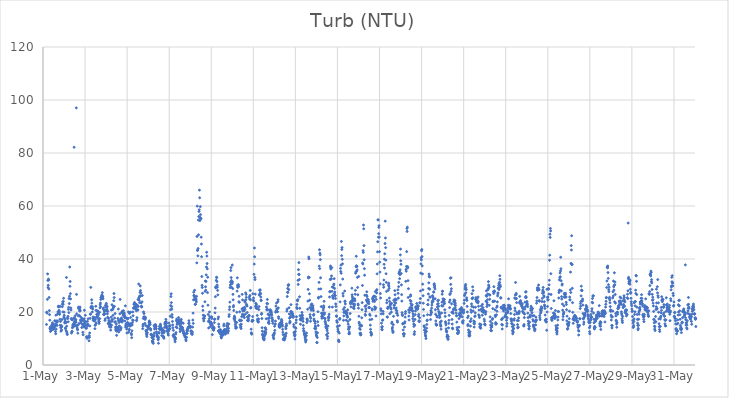
| Category | Turb (NTU) |
|---|---|
| 44682.166666666664 | 15.31 |
| 44682.177083333336 | 19.94 |
| 44682.1875 | 19.66 |
| 44682.197916666664 | 19.62 |
| 44682.208333333336 | 24.77 |
| 44682.21875 | 34.37 |
| 44682.229166666664 | 31.93 |
| 44682.239583333336 | 29.25 |
| 44682.25 | 30.1 |
| 44682.260416666664 | 32.41 |
| 44682.270833333336 | 32.02 |
| 44682.28125 | 28.68 |
| 44682.291666666664 | 25.48 |
| 44682.302083333336 | 20.53 |
| 44682.3125 | 19 |
| 44682.322916666664 | 16.9 |
| 44682.333333333336 | 13.7 |
| 44682.34375 | 14.1 |
| 44682.354166666664 | 12.65 |
| 44682.364583333336 | 14.53 |
| 44682.375 | 13.45 |
| 44682.385416666664 | 13.19 |
| 44682.395833333336 | 13.13 |
| 44682.40625 | 14.02 |
| 44682.416666666664 | 13.38 |
| 44682.427083333336 | 14.59 |
| 44682.4375 | 15.2 |
| 44682.447916666664 | 15.91 |
| 44682.458333333336 | 15.42 |
| 44682.46875 | 14.2 |
| 44682.479166666664 | 15.15 |
| 44682.489583333336 | 14.66 |
| 44682.5 | 13.91 |
| 44682.510416666664 | 13.48 |
| 44682.520833333336 | 14.08 |
| 44682.53125 | 14.3 |
| 44682.541666666664 | 14.42 |
| 44682.552083333336 | 14.63 |
| 44682.5625 | 16.67 |
| 44682.572916666664 | 16.63 |
| 44682.583333333336 | 15.41 |
| 44682.59375 | 12.63 |
| 44682.604166666664 | 11.8 |
| 44682.614583333336 | 18.81 |
| 44682.625 | 13.55 |
| 44682.635416666664 | 15.16 |
| 44682.645833333336 | 16.61 |
| 44682.65625 | 16.1 |
| 44682.666666666664 | 14.93 |
| 44682.677083333336 | 16.27 |
| 44682.6875 | 16.62 |
| 44682.697916666664 | 19.16 |
| 44682.708333333336 | 20.02 |
| 44682.71875 | 19.45 |
| 44682.729166666664 | 22.06 |
| 44682.739583333336 | 22.18 |
| 44682.75 | 21.88 |
| 44682.760416666664 | 20.62 |
| 44682.770833333336 | 20.28 |
| 44682.78125 | 19.63 |
| 44682.791666666664 | 19.1 |
| 44682.802083333336 | 17.27 |
| 44682.8125 | 15 |
| 44682.822916666664 | 22.17 |
| 44682.833333333336 | 16.41 |
| 44682.84375 | 14.07 |
| 44682.854166666664 | 12.75 |
| 44682.864583333336 | 14.84 |
| 44682.875 | 14.23 |
| 44682.885416666664 | 13.24 |
| 44682.895833333336 | 14.72 |
| 44682.90625 | 17.15 |
| 44682.916666666664 | 22 |
| 44682.927083333336 | 23 |
| 44682.9375 | 23.77 |
| 44682.947916666664 | 20.05 |
| 44682.958333333336 | 22.9 |
| 44682.96875 | 23.99 |
| 44682.979166666664 | 25.17 |
| 44682.989583333336 | 18.12 |
| 44683.0 | 19.95 |
| 44683.010416666664 | 18.77 |
| 44683.020833333336 | 17.67 |
| 44683.03125 | 15.88 |
| 44683.041666666664 | 16.25 |
| 44683.052083333336 | 17.07 |
| 44683.0625 | 13.96 |
| 44683.072916666664 | 13.7 |
| 44683.083333333336 | 16.28 |
| 44683.09375 | 15.92 |
| 44683.104166666664 | 12.88 |
| 44683.114583333336 | 33.03 |
| 44683.125 | 14.63 |
| 44683.135416666664 | 12.36 |
| 44683.145833333336 | 11.71 |
| 44683.15625 | 11.5 |
| 44683.166666666664 | 17.73 |
| 44683.177083333336 | 17.53 |
| 44683.1875 | 18.36 |
| 44683.197916666664 | 16.3 |
| 44683.208333333336 | 20.99 |
| 44683.21875 | 21.74 |
| 44683.229166666664 | 19.76 |
| 44683.239583333336 | 25.09 |
| 44683.25 | 23.19 |
| 44683.260416666664 | 25.97 |
| 44683.270833333336 | 36.99 |
| 44683.28125 | 29.7 |
| 44683.291666666664 | 31.52 |
| 44683.302083333336 | 26.95 |
| 44683.3125 | 24.93 |
| 44683.322916666664 | 21.53 |
| 44683.333333333336 | 20.76 |
| 44683.34375 | 17.53 |
| 44683.354166666664 | 12.06 |
| 44683.364583333336 | 17.12 |
| 44683.375 | 12.7 |
| 44683.385416666664 | 12.57 |
| 44683.395833333336 | 14.06 |
| 44683.40625 | 17.05 |
| 44683.416666666664 | 14.8 |
| 44683.427083333336 | 15.36 |
| 44683.4375 | 14.43 |
| 44683.447916666664 | 14.48 |
| 44683.458333333336 | 17.72 |
| 44683.46875 | 15.02 |
| 44683.479166666664 | 82.18 |
| 44683.489583333336 | 16.14 |
| 44683.5 | 16.13 |
| 44683.510416666664 | 15.41 |
| 44683.520833333336 | 17.61 |
| 44683.53125 | 18.59 |
| 44683.541666666664 | 16.83 |
| 44683.552083333336 | 14.84 |
| 44683.5625 | 17.07 |
| 44683.572916666664 | 16.15 |
| 44683.583333333336 | 97.03 |
| 44683.59375 | 26.65 |
| 44683.604166666664 | 19.31 |
| 44683.614583333336 | 14.84 |
| 44683.625 | 13.98 |
| 44683.635416666664 | 13.48 |
| 44683.645833333336 | 13.3 |
| 44683.65625 | 12.02 |
| 44683.666666666664 | 15.1 |
| 44683.677083333336 | 18.55 |
| 44683.6875 | 21.84 |
| 44683.697916666664 | 21.31 |
| 44683.708333333336 | 21.2 |
| 44683.71875 | 15.66 |
| 44683.729166666664 | 18.7 |
| 44683.739583333336 | 20.39 |
| 44683.75 | 21.14 |
| 44683.760416666664 | 21.87 |
| 44683.770833333336 | 20.47 |
| 44683.78125 | 16.99 |
| 44683.791666666664 | 18.11 |
| 44683.802083333336 | 16.64 |
| 44683.8125 | 16.37 |
| 44683.822916666664 | 15.72 |
| 44683.833333333336 | 16.74 |
| 44683.84375 | 14.14 |
| 44683.854166666664 | 16.99 |
| 44683.864583333336 | 17.38 |
| 44683.875 | 17.48 |
| 44683.885416666664 | 15.17 |
| 44683.895833333336 | 12.34 |
| 44683.90625 | 11.42 |
| 44683.916666666664 | 15.48 |
| 44683.927083333336 | 16.86 |
| 44683.9375 | 14.38 |
| 44683.947916666664 | 14.78 |
| 44683.958333333336 | 17.45 |
| 44683.96875 | 20.65 |
| 44683.979166666664 | 15.52 |
| 44683.989583333336 | 16.1 |
| 44684.0 | 16.4 |
| 44684.010416666664 | 18.76 |
| 44684.020833333336 | 16.26 |
| 44684.03125 | 14.89 |
| 44684.041666666664 | 13.93 |
| 44684.052083333336 | 14 |
| 44684.0625 | 13.84 |
| 44684.072916666664 | 10.57 |
| 44684.083333333336 | 10.64 |
| 44684.09375 | 10.06 |
| 44684.104166666664 | 15.27 |
| 44684.114583333336 | 16.48 |
| 44684.125 | 14.77 |
| 44684.135416666664 | 15.44 |
| 44684.145833333336 | 17.44 |
| 44684.15625 | 10.5 |
| 44684.166666666664 | 10.84 |
| 44684.177083333336 | 10.61 |
| 44684.1875 | 9.14 |
| 44684.197916666664 | 11.09 |
| 44684.208333333336 | 10.47 |
| 44684.21875 | 12.08 |
| 44684.229166666664 | 14.74 |
| 44684.239583333336 | 17.59 |
| 44684.25 | 19.2 |
| 44684.260416666664 | 19.17 |
| 44684.270833333336 | 29.29 |
| 44684.28125 | 21.57 |
| 44684.291666666664 | 22.08 |
| 44684.302083333336 | 21.73 |
| 44684.3125 | 24.61 |
| 44684.322916666664 | 23.34 |
| 44684.333333333336 | 21.66 |
| 44684.34375 | 20.03 |
| 44684.354166666664 | 22.02 |
| 44684.364583333336 | 21.1 |
| 44684.375 | 18.12 |
| 44684.385416666664 | 16.89 |
| 44684.395833333336 | 17.46 |
| 44684.40625 | 17.58 |
| 44684.416666666664 | 17.29 |
| 44684.427083333336 | 16.83 |
| 44684.4375 | 16.57 |
| 44684.447916666664 | 17.88 |
| 44684.458333333336 | 16.81 |
| 44684.46875 | 13.69 |
| 44684.479166666664 | 14.94 |
| 44684.489583333336 | 17.17 |
| 44684.5 | 15.27 |
| 44684.510416666664 | 22.15 |
| 44684.520833333336 | 20.64 |
| 44684.53125 | 15.85 |
| 44684.541666666664 | 18 |
| 44684.552083333336 | 19.11 |
| 44684.5625 | 20.39 |
| 44684.572916666664 | 18.38 |
| 44684.583333333336 | 19.22 |
| 44684.59375 | 20.29 |
| 44684.604166666664 | 20.37 |
| 44684.614583333336 | 17.89 |
| 44684.625 | 19.53 |
| 44684.635416666664 | 18.9 |
| 44684.645833333336 | 17.01 |
| 44684.65625 | 16.39 |
| 44684.666666666664 | 15.66 |
| 44684.677083333336 | 16.41 |
| 44684.6875 | 19.89 |
| 44684.697916666664 | 17.49 |
| 44684.708333333336 | 21.54 |
| 44684.71875 | 22.72 |
| 44684.729166666664 | 23.38 |
| 44684.739583333336 | 21.97 |
| 44684.75 | 24.73 |
| 44684.760416666664 | 25.44 |
| 44684.770833333336 | 25.56 |
| 44684.78125 | 25.12 |
| 44684.791666666664 | 26.1 |
| 44684.802083333336 | 26.42 |
| 44684.8125 | 26.1 |
| 44684.822916666664 | 27.32 |
| 44684.833333333336 | 25.83 |
| 44684.84375 | 25.7 |
| 44684.854166666664 | 24.97 |
| 44684.864583333336 | 21.1 |
| 44684.875 | 21.51 |
| 44684.885416666664 | 19.05 |
| 44684.895833333336 | 18.98 |
| 44684.90625 | 19.47 |
| 44684.916666666664 | 20.55 |
| 44684.927083333336 | 20.23 |
| 44684.9375 | 19.31 |
| 44684.947916666664 | 16.84 |
| 44684.958333333336 | 17.41 |
| 44684.96875 | 22.38 |
| 44684.979166666664 | 20.55 |
| 44684.989583333336 | 21.83 |
| 44685.0 | 22.78 |
| 44685.010416666664 | 23.25 |
| 44685.020833333336 | 22.3 |
| 44685.03125 | 20.35 |
| 44685.041666666664 | 21.03 |
| 44685.052083333336 | 21.97 |
| 44685.0625 | 19.31 |
| 44685.072916666664 | 17.98 |
| 44685.083333333336 | 20.24 |
| 44685.09375 | 17.72 |
| 44685.104166666664 | 15.76 |
| 44685.114583333336 | 17.66 |
| 44685.125 | 15.35 |
| 44685.135416666664 | 16.6 |
| 44685.145833333336 | 16.72 |
| 44685.15625 | 15.39 |
| 44685.166666666664 | 14.34 |
| 44685.177083333336 | 14.68 |
| 44685.1875 | 15.5 |
| 44685.197916666664 | 16.09 |
| 44685.208333333336 | 14.97 |
| 44685.21875 | 13.16 |
| 44685.229166666664 | 14.26 |
| 44685.239583333336 | 18.02 |
| 44685.25 | 20.75 |
| 44685.260416666664 | 15 |
| 44685.270833333336 | 16.97 |
| 44685.28125 | 22.72 |
| 44685.291666666664 | 16.54 |
| 44685.302083333336 | 17.14 |
| 44685.3125 | 20.91 |
| 44685.322916666664 | 18.72 |
| 44685.333333333336 | 21.41 |
| 44685.34375 | 22 |
| 44685.354166666664 | 22.02 |
| 44685.364583333336 | 24.26 |
| 44685.375 | 26.96 |
| 44685.385416666664 | 25.47 |
| 44685.395833333336 | 22.12 |
| 44685.40625 | 17.71 |
| 44685.416666666664 | 16.15 |
| 44685.427083333336 | 19.41 |
| 44685.4375 | 16.32 |
| 44685.447916666664 | 14.12 |
| 44685.458333333336 | 13.45 |
| 44685.46875 | 13 |
| 44685.479166666664 | 14.48 |
| 44685.489583333336 | 15.48 |
| 44685.5 | 11.18 |
| 44685.510416666664 | 12.71 |
| 44685.520833333336 | 14.2 |
| 44685.53125 | 13.4 |
| 44685.541666666664 | 14.12 |
| 44685.552083333336 | 13.75 |
| 44685.5625 | 17.57 |
| 44685.572916666664 | 16.79 |
| 44685.583333333336 | 21.11 |
| 44685.59375 | 14.4 |
| 44685.604166666664 | 12.48 |
| 44685.614583333336 | 16.06 |
| 44685.625 | 13.28 |
| 44685.635416666664 | 14.74 |
| 44685.645833333336 | 16.39 |
| 44685.65625 | 19.31 |
| 44685.666666666664 | 24.74 |
| 44685.677083333336 | 17.19 |
| 44685.6875 | 13.24 |
| 44685.697916666664 | 13.77 |
| 44685.708333333336 | 14.13 |
| 44685.71875 | 16.65 |
| 44685.729166666664 | 17.74 |
| 44685.739583333336 | 19.89 |
| 44685.75 | 17.13 |
| 44685.760416666664 | 16.17 |
| 44685.770833333336 | 20.26 |
| 44685.78125 | 19.67 |
| 44685.791666666664 | 16.78 |
| 44685.802083333336 | 19.33 |
| 44685.8125 | 18.69 |
| 44685.822916666664 | 20.5 |
| 44685.833333333336 | 19.76 |
| 44685.84375 | 19.1 |
| 44685.854166666664 | 19.08 |
| 44685.864583333336 | 19.54 |
| 44685.875 | 17.96 |
| 44685.885416666664 | 18.49 |
| 44685.895833333336 | 16.63 |
| 44685.90625 | 17.92 |
| 44685.916666666664 | 22.32 |
| 44685.927083333336 | 14.31 |
| 44685.9375 | 14.9 |
| 44685.947916666664 | 15.36 |
| 44685.958333333336 | 15.58 |
| 44685.96875 | 17.72 |
| 44685.979166666664 | 13.57 |
| 44685.989583333336 | 12.1 |
| 44686.0 | 15.9 |
| 44686.010416666664 | 14.5 |
| 44686.020833333336 | 17.37 |
| 44686.03125 | 16 |
| 44686.041666666664 | 17.64 |
| 44686.052083333336 | 15.08 |
| 44686.0625 | 20.03 |
| 44686.072916666664 | 12.38 |
| 44686.083333333336 | 15.42 |
| 44686.09375 | 13.26 |
| 44686.104166666664 | 13.43 |
| 44686.114583333336 | 19.46 |
| 44686.125 | 15.49 |
| 44686.135416666664 | 14.63 |
| 44686.145833333336 | 19.82 |
| 44686.15625 | 19.93 |
| 44686.166666666664 | 17.92 |
| 44686.177083333336 | 15.58 |
| 44686.1875 | 15.01 |
| 44686.197916666664 | 11.94 |
| 44686.208333333336 | 11.4 |
| 44686.21875 | 10.31 |
| 44686.229166666664 | 12.91 |
| 44686.239583333336 | 15.11 |
| 44686.25 | 16 |
| 44686.260416666664 | 16.96 |
| 44686.270833333336 | 20.04 |
| 44686.28125 | 18.6 |
| 44686.291666666664 | 16.86 |
| 44686.302083333336 | 21.46 |
| 44686.3125 | 21.58 |
| 44686.322916666664 | 22.89 |
| 44686.333333333336 | 21.47 |
| 44686.34375 | 23.13 |
| 44686.354166666664 | 23.56 |
| 44686.364583333336 | 22.06 |
| 44686.375 | 23.04 |
| 44686.385416666664 | 21.27 |
| 44686.395833333336 | 21.29 |
| 44686.40625 | 22.99 |
| 44686.416666666664 | 21.75 |
| 44686.427083333336 | 22.68 |
| 44686.4375 | 20.47 |
| 44686.447916666664 | 16.73 |
| 44686.458333333336 | 17.01 |
| 44686.46875 | 17.87 |
| 44686.479166666664 | 22.6 |
| 44686.489583333336 | 22.23 |
| 44686.5 | 20.86 |
| 44686.510416666664 | 20.72 |
| 44686.520833333336 | 24.73 |
| 44686.53125 | 22.11 |
| 44686.541666666664 | 24.7 |
| 44686.552083333336 | 30.55 |
| 44686.5625 | 25.44 |
| 44686.572916666664 | 24.45 |
| 44686.583333333336 | 25.66 |
| 44686.59375 | 23.55 |
| 44686.604166666664 | 26.09 |
| 44686.614583333336 | 27.41 |
| 44686.625 | 29.84 |
| 44686.635416666664 | 28.1 |
| 44686.645833333336 | 26.1 |
| 44686.65625 | 27.22 |
| 44686.666666666664 | 23.42 |
| 44686.677083333336 | 22.19 |
| 44686.6875 | 21.99 |
| 44686.697916666664 | 21.88 |
| 44686.708333333336 | 23.83 |
| 44686.71875 | 26.22 |
| 44686.739583333336 | 13.72 |
| 44686.75 | 14.66 |
| 44686.760416666664 | 15.37 |
| 44686.770833333336 | 17.58 |
| 44686.78125 | 20.03 |
| 44686.791666666664 | 18.12 |
| 44686.802083333336 | 19.41 |
| 44686.8125 | 17.49 |
| 44686.822916666664 | 18.14 |
| 44686.833333333336 | 17.83 |
| 44686.84375 | 15.72 |
| 44686.854166666664 | 17.2 |
| 44686.864583333336 | 18.02 |
| 44686.875 | 17.76 |
| 44686.885416666664 | 14.9 |
| 44686.895833333336 | 13.03 |
| 44686.90625 | 12.75 |
| 44686.916666666664 | 11.98 |
| 44686.927083333336 | 11.33 |
| 44686.9375 | 10.77 |
| 44686.947916666664 | 11.74 |
| 44686.958333333336 | 12.23 |
| 44686.96875 | 13.41 |
| 44686.979166666664 | 14.29 |
| 44686.989583333336 | 14.58 |
| 44687.0 | 14.5 |
| 44687.010416666664 | 14.11 |
| 44687.020833333336 | 14.75 |
| 44687.03125 | 14.96 |
| 44687.041666666664 | 16.06 |
| 44687.052083333336 | 16.61 |
| 44687.0625 | 16.28 |
| 44687.072916666664 | 15.7 |
| 44687.083333333336 | 16.01 |
| 44687.09375 | 15.32 |
| 44687.104166666664 | 13.69 |
| 44687.114583333336 | 13.61 |
| 44687.125 | 13.17 |
| 44687.135416666664 | 11.52 |
| 44687.145833333336 | 11.47 |
| 44687.15625 | 11.58 |
| 44687.166666666664 | 11.19 |
| 44687.177083333336 | 10.46 |
| 44687.1875 | 10.32 |
| 44687.197916666664 | 9.12 |
| 44687.208333333336 | 8.9 |
| 44687.21875 | 8.54 |
| 44687.229166666664 | 8.69 |
| 44687.239583333336 | 8.17 |
| 44687.25 | 9.72 |
| 44687.260416666664 | 10.7 |
| 44687.270833333336 | 11.19 |
| 44687.28125 | 14.87 |
| 44687.291666666664 | 12.06 |
| 44687.302083333336 | 13.6 |
| 44687.3125 | 14.32 |
| 44687.322916666664 | 15.16 |
| 44687.333333333336 | 14.48 |
| 44687.34375 | 15 |
| 44687.354166666664 | 15.19 |
| 44687.364583333336 | 14.68 |
| 44687.375 | 14.58 |
| 44687.385416666664 | 13.75 |
| 44687.395833333336 | 12.54 |
| 44687.40625 | 11.8 |
| 44687.416666666664 | 11.26 |
| 44687.427083333336 | 10.83 |
| 44687.4375 | 10.99 |
| 44687.447916666664 | 10.59 |
| 44687.458333333336 | 10.6 |
| 44687.46875 | 9.79 |
| 44687.479166666664 | 9.52 |
| 44687.489583333336 | 8.19 |
| 44687.5 | 10.35 |
| 44687.510416666664 | 12.26 |
| 44687.520833333336 | 12.01 |
| 44687.53125 | 13.56 |
| 44687.541666666664 | 14.61 |
| 44687.552083333336 | 13.52 |
| 44687.5625 | 14.05 |
| 44687.572916666664 | 13.8 |
| 44687.583333333336 | 15.39 |
| 44687.59375 | 14.71 |
| 44687.604166666664 | 13.25 |
| 44687.614583333336 | 14.02 |
| 44687.625 | 13.76 |
| 44687.635416666664 | 13.72 |
| 44687.645833333336 | 11.11 |
| 44687.65625 | 13.07 |
| 44687.666666666664 | 12.16 |
| 44687.677083333336 | 12.88 |
| 44687.6875 | 13.47 |
| 44687.697916666664 | 12.6 |
| 44687.708333333336 | 12.04 |
| 44687.71875 | 10.86 |
| 44687.729166666664 | 10.53 |
| 44687.739583333336 | 10.6 |
| 44687.75 | 10.07 |
| 44687.760416666664 | 12.33 |
| 44687.770833333336 | 12.83 |
| 44687.78125 | 14.22 |
| 44687.791666666664 | 15.41 |
| 44687.802083333336 | 15.83 |
| 44687.8125 | 16.1 |
| 44687.822916666664 | 14.47 |
| 44687.833333333336 | 16.09 |
| 44687.84375 | 17.23 |
| 44687.854166666664 | 16.37 |
| 44687.864583333336 | 14.83 |
| 44687.875 | 15.72 |
| 44687.885416666664 | 13.91 |
| 44687.895833333336 | 14.18 |
| 44687.90625 | 13.03 |
| 44687.916666666664 | 12.7 |
| 44687.927083333336 | 12.61 |
| 44687.9375 | 12.69 |
| 44687.947916666664 | 11.8 |
| 44687.958333333336 | 11.28 |
| 44687.96875 | 12.8 |
| 44687.979166666664 | 13.15 |
| 44687.989583333336 | 15.82 |
| 44688.0 | 14.64 |
| 44688.010416666664 | 13.6 |
| 44688.020833333336 | 14.59 |
| 44688.03125 | 13.68 |
| 44688.041666666664 | 14.86 |
| 44688.052083333336 | 18.37 |
| 44688.0625 | 20.87 |
| 44688.072916666664 | 22.41 |
| 44688.083333333336 | 25.85 |
| 44688.09375 | 26.87 |
| 44688.104166666664 | 23.54 |
| 44688.114583333336 | 22.03 |
| 44688.125 | 21.05 |
| 44688.135416666664 | 19.01 |
| 44688.145833333336 | 17.99 |
| 44688.15625 | 16.45 |
| 44688.166666666664 | 15.13 |
| 44688.177083333336 | 14.07 |
| 44688.1875 | 11.22 |
| 44688.197916666664 | 13.08 |
| 44688.208333333336 | 10.89 |
| 44688.21875 | 11.53 |
| 44688.229166666664 | 10.56 |
| 44688.239583333336 | 10.44 |
| 44688.25 | 10.51 |
| 44688.260416666664 | 10.54 |
| 44688.270833333336 | 9.44 |
| 44688.28125 | 8.75 |
| 44688.291666666664 | 9.7 |
| 44688.302083333336 | 10.2 |
| 44688.3125 | 11.67 |
| 44688.322916666664 | 12.23 |
| 44688.333333333336 | 14.4 |
| 44688.34375 | 16.68 |
| 44688.354166666664 | 17.33 |
| 44688.364583333336 | 14.06 |
| 44688.375 | 15.45 |
| 44688.385416666664 | 15.41 |
| 44688.395833333336 | 16.23 |
| 44688.40625 | 16.13 |
| 44688.416666666664 | 16.78 |
| 44688.427083333336 | 16.26 |
| 44688.4375 | 16.26 |
| 44688.447916666664 | 17.91 |
| 44688.458333333336 | 16.59 |
| 44688.46875 | 16.76 |
| 44688.479166666664 | 17.04 |
| 44688.489583333336 | 15.78 |
| 44688.5 | 15.23 |
| 44688.510416666664 | 13.7 |
| 44688.520833333336 | 12.6 |
| 44688.53125 | 13.34 |
| 44688.541666666664 | 14.76 |
| 44688.552083333336 | 14.45 |
| 44688.5625 | 16.58 |
| 44688.572916666664 | 17.21 |
| 44688.583333333336 | 15.75 |
| 44688.59375 | 16.02 |
| 44688.604166666664 | 14.29 |
| 44688.614583333336 | 13.33 |
| 44688.625 | 14.12 |
| 44688.635416666664 | 14.03 |
| 44688.645833333336 | 13.42 |
| 44688.65625 | 12.77 |
| 44688.666666666664 | 15.74 |
| 44688.677083333336 | 12.05 |
| 44688.6875 | 12.65 |
| 44688.697916666664 | 11.72 |
| 44688.708333333336 | 11.77 |
| 44688.71875 | 11.23 |
| 44688.729166666664 | 12.06 |
| 44688.739583333336 | 11.53 |
| 44688.75 | 10.61 |
| 44688.760416666664 | 10.61 |
| 44688.770833333336 | 10.49 |
| 44688.78125 | 10.61 |
| 44688.791666666664 | 9.66 |
| 44688.802083333336 | 9.14 |
| 44688.8125 | 10.34 |
| 44688.822916666664 | 10.48 |
| 44688.833333333336 | 11.91 |
| 44688.84375 | 13.1 |
| 44688.854166666664 | 11.95 |
| 44688.864583333336 | 12.75 |
| 44688.875 | 13.34 |
| 44688.885416666664 | 13.89 |
| 44688.895833333336 | 13.81 |
| 44688.90625 | 14.24 |
| 44688.916666666664 | 14.21 |
| 44688.927083333336 | 15.64 |
| 44688.9375 | 16.72 |
| 44688.947916666664 | 15.87 |
| 44688.958333333336 | 14.38 |
| 44688.96875 | 14.63 |
| 44688.979166666664 | 14.7 |
| 44688.989583333336 | 14.66 |
| 44689.0 | 14.52 |
| 44689.010416666664 | 14.17 |
| 44689.020833333336 | 14.46 |
| 44689.03125 | 12.9 |
| 44689.041666666664 | 12.69 |
| 44689.052083333336 | 12.72 |
| 44689.0625 | 11.94 |
| 44689.072916666664 | 11.76 |
| 44689.083333333336 | 11.78 |
| 44689.09375 | 11.55 |
| 44689.104166666664 | 12.43 |
| 44689.114583333336 | 14.3 |
| 44689.125 | 16.97 |
| 44689.135416666664 | 19.58 |
| 44689.145833333336 | 15.7 |
| 44689.15625 | 24.61 |
| 44689.166666666664 | 27.47 |
| 44689.177083333336 | 26.28 |
| 44689.1875 | 25.97 |
| 44689.197916666664 | 26.15 |
| 44689.208333333336 | 28.19 |
| 44689.21875 | 25.58 |
| 44689.229166666664 | 24.99 |
| 44689.239583333336 | 22.84 |
| 44689.25 | 22.94 |
| 44689.260416666664 | 24.31 |
| 44689.270833333336 | 24.47 |
| 44689.28125 | 24.87 |
| 44689.291666666664 | 23.81 |
| 44689.302083333336 | 25.9 |
| 44689.3125 | 38.54 |
| 44689.322916666664 | 48.51 |
| 44689.333333333336 | 59.96 |
| 44689.34375 | 43.21 |
| 44689.354166666664 | 43.37 |
| 44689.364583333336 | 41.18 |
| 44689.375 | 43.96 |
| 44689.385416666664 | 54.71 |
| 44689.395833333336 | 49.14 |
| 44689.40625 | 56.06 |
| 44689.416666666664 | 57.94 |
| 44689.427083333336 | 58.57 |
| 44689.4375 | 65.99 |
| 44689.447916666664 | 63.11 |
| 44689.458333333336 | 54.5 |
| 44689.46875 | 55.69 |
| 44689.479166666664 | 59.77 |
| 44689.489583333336 | 56.74 |
| 44689.5 | 55.34 |
| 44689.510416666664 | 55.19 |
| 44689.520833333336 | 48.23 |
| 44689.53125 | 45.65 |
| 44689.541666666664 | 40.86 |
| 44689.552083333336 | 33.39 |
| 44689.5625 | 30.05 |
| 44689.572916666664 | 29.24 |
| 44689.583333333336 | 27.06 |
| 44689.59375 | 22.19 |
| 44689.604166666664 | 20.62 |
| 44689.614583333336 | 18.79 |
| 44689.625 | 17.54 |
| 44689.635416666664 | 17.54 |
| 44689.645833333336 | 16.63 |
| 44689.65625 | 17.69 |
| 44689.666666666664 | 17.65 |
| 44689.677083333336 | 18.53 |
| 44689.6875 | 18.49 |
| 44689.697916666664 | 23.87 |
| 44689.708333333336 | 27.78 |
| 44689.71875 | 31.72 |
| 44689.729166666664 | 29.51 |
| 44689.739583333336 | 28.25 |
| 44689.75 | 31.52 |
| 44689.760416666664 | 34 |
| 44689.770833333336 | 36.98 |
| 44689.78125 | 42.54 |
| 44689.791666666664 | 41.12 |
| 44689.802083333336 | 38.28 |
| 44689.8125 | 36.28 |
| 44689.822916666664 | 27.32 |
| 44689.833333333336 | 33.11 |
| 44689.84375 | 22.58 |
| 44689.854166666664 | 19.05 |
| 44689.864583333336 | 16.47 |
| 44689.875 | 13.97 |
| 44689.885416666664 | 16.34 |
| 44689.895833333336 | 16.51 |
| 44689.90625 | 17.43 |
| 44689.916666666664 | 20.02 |
| 44689.927083333336 | 18.25 |
| 44689.9375 | 16.31 |
| 44689.947916666664 | 16.21 |
| 44689.958333333336 | 14.53 |
| 44689.96875 | 15.42 |
| 44689.979166666664 | 15.61 |
| 44689.989583333336 | 16.11 |
| 44690.0 | 18.11 |
| 44690.010416666664 | 15.68 |
| 44690.020833333336 | 18.17 |
| 44690.03125 | 17.57 |
| 44690.041666666664 | 15.19 |
| 44690.052083333336 | 11.46 |
| 44690.0625 | 13.98 |
| 44690.072916666664 | 13.82 |
| 44690.083333333336 | 14.51 |
| 44690.09375 | 13.58 |
| 44690.104166666664 | 13.25 |
| 44690.114583333336 | 13.13 |
| 44690.125 | 14.1 |
| 44690.135416666664 | 13.84 |
| 44690.145833333336 | 16.01 |
| 44690.15625 | 17.18 |
| 44690.166666666664 | 17.35 |
| 44690.177083333336 | 19.68 |
| 44690.1875 | 21.47 |
| 44690.197916666664 | 25.8 |
| 44690.208333333336 | 29.37 |
| 44690.21875 | 29.08 |
| 44690.229166666664 | 29.56 |
| 44690.239583333336 | 31.95 |
| 44690.25 | 33.09 |
| 44690.260416666664 | 32.99 |
| 44690.270833333336 | 31.5 |
| 44690.28125 | 30.17 |
| 44690.291666666664 | 29.37 |
| 44690.302083333336 | 28.14 |
| 44690.3125 | 26.45 |
| 44690.322916666664 | 17.41 |
| 44690.333333333336 | 12.85 |
| 44690.34375 | 18.1 |
| 44690.354166666664 | 15.43 |
| 44690.364583333336 | 14.42 |
| 44690.375 | 12.46 |
| 44690.385416666664 | 13.21 |
| 44690.395833333336 | 12.14 |
| 44690.40625 | 12.44 |
| 44690.416666666664 | 12.93 |
| 44690.427083333336 | 12.42 |
| 44690.4375 | 13.35 |
| 44690.447916666664 | 11.76 |
| 44690.458333333336 | 11.43 |
| 44690.46875 | 10.73 |
| 44690.479166666664 | 10.2 |
| 44690.489583333336 | 10.57 |
| 44690.5 | 11.97 |
| 44690.510416666664 | 11.58 |
| 44690.520833333336 | 12.67 |
| 44690.53125 | 12.36 |
| 44690.541666666664 | 12.42 |
| 44690.552083333336 | 11.54 |
| 44690.5625 | 11.44 |
| 44690.572916666664 | 11.34 |
| 44690.583333333336 | 12.49 |
| 44690.59375 | 14.76 |
| 44690.604166666664 | 15.42 |
| 44690.614583333336 | 12.98 |
| 44690.625 | 13.35 |
| 44690.635416666664 | 13.37 |
| 44690.645833333336 | 13.15 |
| 44690.65625 | 12.18 |
| 44690.666666666664 | 11.91 |
| 44690.677083333336 | 11.67 |
| 44690.6875 | 12.34 |
| 44690.697916666664 | 12.97 |
| 44690.708333333336 | 12.92 |
| 44690.71875 | 13.01 |
| 44690.729166666664 | 13.57 |
| 44690.739583333336 | 14.84 |
| 44690.75 | 14.55 |
| 44690.760416666664 | 15.66 |
| 44690.770833333336 | 14.66 |
| 44690.78125 | 14.68 |
| 44690.791666666664 | 12.09 |
| 44690.802083333336 | 12.75 |
| 44690.8125 | 12.91 |
| 44690.822916666664 | 13.82 |
| 44690.833333333336 | 15.48 |
| 44690.84375 | 18.32 |
| 44690.854166666664 | 19.01 |
| 44690.864583333336 | 20.92 |
| 44690.875 | 21.93 |
| 44690.885416666664 | 23.72 |
| 44690.895833333336 | 29.23 |
| 44690.90625 | 30.19 |
| 44690.916666666664 | 31.29 |
| 44690.927083333336 | 35.64 |
| 44690.9375 | 36.77 |
| 44690.947916666664 | 32.99 |
| 44690.958333333336 | 31.88 |
| 44690.96875 | 29.29 |
| 44690.979166666664 | 30.69 |
| 44690.989583333336 | 30.81 |
| 44691.0 | 37.73 |
| 44691.010416666664 | 31.38 |
| 44691.020833333336 | 28.82 |
| 44691.03125 | 26.66 |
| 44691.041666666664 | 24.59 |
| 44691.052083333336 | 21.94 |
| 44691.0625 | 22.44 |
| 44691.072916666664 | 20.57 |
| 44691.083333333336 | 17.44 |
| 44691.09375 | 18.04 |
| 44691.104166666664 | 18.45 |
| 44691.114583333336 | 16.95 |
| 44691.125 | 17.72 |
| 44691.135416666664 | 16.37 |
| 44691.145833333336 | 15.38 |
| 44691.15625 | 14.67 |
| 44691.166666666664 | 13.96 |
| 44691.177083333336 | 13.89 |
| 44691.1875 | 14.28 |
| 44691.197916666664 | 14.14 |
| 44691.208333333336 | 16.05 |
| 44691.21875 | 19.89 |
| 44691.229166666664 | 27.89 |
| 44691.239583333336 | 32.9 |
| 44691.25 | 30.08 |
| 44691.260416666664 | 29.31 |
| 44691.270833333336 | 29.61 |
| 44691.28125 | 29.47 |
| 44691.291666666664 | 30.33 |
| 44691.302083333336 | 29.7 |
| 44691.3125 | 23.87 |
| 44691.322916666664 | 25.93 |
| 44691.333333333336 | 23.65 |
| 44691.34375 | 16.8 |
| 44691.354166666664 | 20.06 |
| 44691.364583333336 | 17.02 |
| 44691.375 | 15.17 |
| 44691.385416666664 | 16.7 |
| 44691.395833333336 | 14.23 |
| 44691.40625 | 14.47 |
| 44691.416666666664 | 13.77 |
| 44691.427083333336 | 15.4 |
| 44691.4375 | 16.83 |
| 44691.447916666664 | 18.25 |
| 44691.458333333336 | 21.12 |
| 44691.46875 | 26.66 |
| 44691.479166666664 | 19.12 |
| 44691.489583333336 | 24.55 |
| 44691.5 | 20.41 |
| 44691.510416666664 | 21.48 |
| 44691.520833333336 | 18.93 |
| 44691.53125 | 18.51 |
| 44691.541666666664 | 18.46 |
| 44691.552083333336 | 20.55 |
| 44691.5625 | 20.4 |
| 44691.572916666664 | 17.88 |
| 44691.583333333336 | 21.77 |
| 44691.59375 | 24.13 |
| 44691.604166666664 | 21.03 |
| 44691.614583333336 | 23.66 |
| 44691.625 | 19.2 |
| 44691.635416666664 | 27.22 |
| 44691.645833333336 | 24.57 |
| 44691.65625 | 26.64 |
| 44691.666666666664 | 25.52 |
| 44691.677083333336 | 22.87 |
| 44691.6875 | 22.54 |
| 44691.697916666664 | 22.23 |
| 44691.708333333336 | 19.8 |
| 44691.71875 | 18.17 |
| 44691.729166666664 | 16.79 |
| 44691.739583333336 | 16.88 |
| 44691.75 | 16.97 |
| 44691.760416666664 | 16.68 |
| 44691.770833333336 | 17.43 |
| 44691.78125 | 18.31 |
| 44691.791666666664 | 18.55 |
| 44691.802083333336 | 18.77 |
| 44691.8125 | 25.73 |
| 44691.822916666664 | 24.99 |
| 44691.833333333336 | 24.92 |
| 44691.84375 | 26.23 |
| 44691.854166666664 | 28.13 |
| 44691.864583333336 | 24.58 |
| 44691.875 | 21.48 |
| 44691.885416666664 | 21.68 |
| 44691.895833333336 | 13.51 |
| 44691.90625 | 12.16 |
| 44691.916666666664 | 11.82 |
| 44691.927083333336 | 11.64 |
| 44691.9375 | 16.47 |
| 44691.947916666664 | 16.9 |
| 44691.958333333336 | 16.57 |
| 44691.96875 | 18.27 |
| 44691.979166666664 | 26.91 |
| 44691.989583333336 | 16.79 |
| 44692.0 | 24.44 |
| 44692.010416666664 | 25.31 |
| 44692.020833333336 | 24.18 |
| 44692.03125 | 34.21 |
| 44692.041666666664 | 38.08 |
| 44692.052083333336 | 44.15 |
| 44692.0625 | 40.84 |
| 44692.072916666664 | 33.04 |
| 44692.083333333336 | 32.24 |
| 44692.09375 | 26.73 |
| 44692.104166666664 | 22.09 |
| 44692.114583333336 | 23.28 |
| 44692.125 | 21.49 |
| 44692.135416666664 | 22.55 |
| 44692.145833333336 | 22.92 |
| 44692.15625 | 21.72 |
| 44692.166666666664 | 21.73 |
| 44692.177083333336 | 21.24 |
| 44692.1875 | 18.71 |
| 44692.197916666664 | 17.28 |
| 44692.208333333336 | 16.79 |
| 44692.21875 | 16.34 |
| 44692.229166666664 | 16.52 |
| 44692.239583333336 | 16.18 |
| 44692.25 | 17.37 |
| 44692.260416666664 | 20.92 |
| 44692.270833333336 | 22.05 |
| 44692.28125 | 26.37 |
| 44692.291666666664 | 26.67 |
| 44692.302083333336 | 28.17 |
| 44692.3125 | 28.23 |
| 44692.322916666664 | 28.37 |
| 44692.333333333336 | 27.17 |
| 44692.34375 | 26.84 |
| 44692.354166666664 | 25.69 |
| 44692.364583333336 | 24.52 |
| 44692.375 | 24.29 |
| 44692.385416666664 | 19.15 |
| 44692.395833333336 | 19.46 |
| 44692.40625 | 17.53 |
| 44692.416666666664 | 14.07 |
| 44692.427083333336 | 12.75 |
| 44692.4375 | 11.61 |
| 44692.447916666664 | 11.09 |
| 44692.458333333336 | 11.4 |
| 44692.46875 | 10.4 |
| 44692.479166666664 | 9.95 |
| 44692.489583333336 | 9.82 |
| 44692.5 | 10.49 |
| 44692.510416666664 | 9.45 |
| 44692.520833333336 | 9.92 |
| 44692.53125 | 12.63 |
| 44692.541666666664 | 11.05 |
| 44692.552083333336 | 12.16 |
| 44692.5625 | 14 |
| 44692.572916666664 | 13.97 |
| 44692.583333333336 | 11.71 |
| 44692.59375 | 12.35 |
| 44692.604166666664 | 13.38 |
| 44692.614583333336 | 17.46 |
| 44692.625 | 21.88 |
| 44692.635416666664 | 20.83 |
| 44692.645833333336 | 23.24 |
| 44692.65625 | 21.07 |
| 44692.666666666664 | 24.73 |
| 44692.677083333336 | 23.13 |
| 44692.6875 | 20.81 |
| 44692.697916666664 | 19.12 |
| 44692.708333333336 | 17.54 |
| 44692.71875 | 16.02 |
| 44692.729166666664 | 15.88 |
| 44692.739583333336 | 16.58 |
| 44692.75 | 15.67 |
| 44692.760416666664 | 17.67 |
| 44692.770833333336 | 18.59 |
| 44692.78125 | 18.92 |
| 44692.791666666664 | 19.96 |
| 44692.802083333336 | 20.89 |
| 44692.8125 | 20.54 |
| 44692.822916666664 | 20.14 |
| 44692.833333333336 | 20.39 |
| 44692.84375 | 20.27 |
| 44692.854166666664 | 19.72 |
| 44692.864583333336 | 19.21 |
| 44692.875 | 18.79 |
| 44692.885416666664 | 17.7 |
| 44692.895833333336 | 17.78 |
| 44692.90625 | 16.54 |
| 44692.916666666664 | 17.05 |
| 44692.927083333336 | 15.75 |
| 44692.9375 | 11.28 |
| 44692.947916666664 | 11.12 |
| 44692.958333333336 | 10.49 |
| 44692.96875 | 9.91 |
| 44692.979166666664 | 11.49 |
| 44692.989583333336 | 11.84 |
| 44693.0 | 12.11 |
| 44693.010416666664 | 14.6 |
| 44693.020833333336 | 13.06 |
| 44693.03125 | 15.42 |
| 44693.041666666664 | 15.47 |
| 44693.052083333336 | 16.57 |
| 44693.0625 | 19.93 |
| 44693.072916666664 | 22.24 |
| 44693.083333333336 | 20.4 |
| 44693.09375 | 20.21 |
| 44693.104166666664 | 23.37 |
| 44693.114583333336 | 21.17 |
| 44693.125 | 20.12 |
| 44693.135416666664 | 20.17 |
| 44693.145833333336 | 20.12 |
| 44693.15625 | 21.31 |
| 44693.166666666664 | 23.86 |
| 44693.177083333336 | 24.61 |
| 44693.1875 | 21.56 |
| 44693.197916666664 | 18.2 |
| 44693.208333333336 | 17.58 |
| 44693.21875 | 15.03 |
| 44693.229166666664 | 14.37 |
| 44693.239583333336 | 14.35 |
| 44693.25 | 15.65 |
| 44693.260416666664 | 14.57 |
| 44693.270833333336 | 14.25 |
| 44693.28125 | 15.18 |
| 44693.291666666664 | 15.39 |
| 44693.302083333336 | 15.93 |
| 44693.3125 | 15.28 |
| 44693.322916666664 | 15.51 |
| 44693.333333333336 | 16.45 |
| 44693.34375 | 17.14 |
| 44693.354166666664 | 16.77 |
| 44693.364583333336 | 15.97 |
| 44693.375 | 15.19 |
| 44693.385416666664 | 14.71 |
| 44693.395833333336 | 13.44 |
| 44693.40625 | 12.38 |
| 44693.416666666664 | 11.45 |
| 44693.427083333336 | 9.58 |
| 44693.4375 | 9.77 |
| 44693.447916666664 | 9.83 |
| 44693.458333333336 | 9.86 |
| 44693.46875 | 10.43 |
| 44693.479166666664 | 9.44 |
| 44693.489583333336 | 10.06 |
| 44693.5 | 10.08 |
| 44693.510416666664 | 11.49 |
| 44693.520833333336 | 11.2 |
| 44693.53125 | 10.8 |
| 44693.541666666664 | 14.37 |
| 44693.552083333336 | 13.69 |
| 44693.5625 | 12 |
| 44693.572916666664 | 15.48 |
| 44693.583333333336 | 14.84 |
| 44693.59375 | 20.34 |
| 44693.604166666664 | 21.08 |
| 44693.614583333336 | 25.86 |
| 44693.625 | 27.41 |
| 44693.635416666664 | 28.91 |
| 44693.645833333336 | 27.4 |
| 44693.65625 | 30.17 |
| 44693.666666666664 | 29.98 |
| 44693.677083333336 | 30.33 |
| 44693.6875 | 28.43 |
| 44693.697916666664 | 21.59 |
| 44693.708333333336 | 19.25 |
| 44693.71875 | 17.66 |
| 44693.729166666664 | 15.85 |
| 44693.739583333336 | 16.52 |
| 44693.75 | 16.18 |
| 44693.760416666664 | 18.19 |
| 44693.770833333336 | 18.02 |
| 44693.78125 | 20.18 |
| 44693.791666666664 | 22.77 |
| 44693.802083333336 | 19.08 |
| 44693.8125 | 19.69 |
| 44693.822916666664 | 20.02 |
| 44693.833333333336 | 20.04 |
| 44693.84375 | 19.36 |
| 44693.854166666664 | 19.57 |
| 44693.864583333336 | 19.19 |
| 44693.875 | 18.44 |
| 44693.885416666664 | 18.02 |
| 44693.895833333336 | 18.56 |
| 44693.90625 | 18.17 |
| 44693.916666666664 | 15.25 |
| 44693.927083333336 | 14.39 |
| 44693.9375 | 12.36 |
| 44693.947916666664 | 11.9 |
| 44693.958333333336 | 11.24 |
| 44693.96875 | 10.94 |
| 44693.979166666664 | 9.79 |
| 44693.989583333336 | 11.34 |
| 44694.0 | 12.66 |
| 44694.010416666664 | 14.07 |
| 44694.020833333336 | 13.84 |
| 44694.03125 | 15.96 |
| 44694.041666666664 | 16.98 |
| 44694.052083333336 | 18.2 |
| 44694.0625 | 21.71 |
| 44694.072916666664 | 22.84 |
| 44694.083333333336 | 21.28 |
| 44694.09375 | 24.37 |
| 44694.104166666664 | 24.24 |
| 44694.114583333336 | 24.67 |
| 44694.125 | 31.94 |
| 44694.135416666664 | 30.42 |
| 44694.145833333336 | 35.98 |
| 44694.15625 | 34.22 |
| 44694.166666666664 | 38.65 |
| 44694.177083333336 | 34.14 |
| 44694.1875 | 32.26 |
| 44694.197916666664 | 25.74 |
| 44694.208333333336 | 21.39 |
| 44694.21875 | 18.62 |
| 44694.229166666664 | 17.19 |
| 44694.239583333336 | 15.4 |
| 44694.25 | 17.39 |
| 44694.260416666664 | 17.11 |
| 44694.270833333336 | 16.93 |
| 44694.28125 | 17.88 |
| 44694.291666666664 | 17.23 |
| 44694.302083333336 | 18.4 |
| 44694.3125 | 19.84 |
| 44694.322916666664 | 18.98 |
| 44694.333333333336 | 18.62 |
| 44694.34375 | 17.48 |
| 44694.354166666664 | 17.6 |
| 44694.364583333336 | 16.46 |
| 44694.375 | 14.95 |
| 44694.385416666664 | 13.74 |
| 44694.395833333336 | 12.91 |
| 44694.40625 | 12.8 |
| 44694.416666666664 | 12.45 |
| 44694.427083333336 | 11.68 |
| 44694.4375 | 11.66 |
| 44694.447916666664 | 11.16 |
| 44694.458333333336 | 10.25 |
| 44694.46875 | 10.63 |
| 44694.479166666664 | 9.47 |
| 44694.489583333336 | 8.68 |
| 44694.5 | 9.1 |
| 44694.510416666664 | 9.53 |
| 44694.520833333336 | 11.05 |
| 44694.53125 | 12.06 |
| 44694.541666666664 | 16 |
| 44694.552083333336 | 17.37 |
| 44694.5625 | 17.25 |
| 44694.572916666664 | 16.66 |
| 44694.583333333336 | 21.02 |
| 44694.59375 | 24.12 |
| 44694.604166666664 | 28.53 |
| 44694.614583333336 | 32.87 |
| 44694.625 | 33.19 |
| 44694.635416666664 | 40.72 |
| 44694.645833333336 | 40.07 |
| 44694.65625 | 33.05 |
| 44694.666666666664 | 26.87 |
| 44694.677083333336 | 24.46 |
| 44694.6875 | 21.64 |
| 44694.697916666664 | 19.02 |
| 44694.708333333336 | 18.14 |
| 44694.71875 | 16.5 |
| 44694.729166666664 | 17.62 |
| 44694.739583333336 | 22.64 |
| 44694.75 | 20.67 |
| 44694.760416666664 | 21.06 |
| 44694.770833333336 | 21.77 |
| 44694.78125 | 23.07 |
| 44694.791666666664 | 21.51 |
| 44694.802083333336 | 21.92 |
| 44694.8125 | 21.52 |
| 44694.822916666664 | 21.75 |
| 44694.833333333336 | 22.39 |
| 44694.84375 | 21.13 |
| 44694.854166666664 | 20.53 |
| 44694.864583333336 | 18.74 |
| 44694.875 | 19.11 |
| 44694.885416666664 | 17.36 |
| 44694.895833333336 | 16.82 |
| 44694.90625 | 16.67 |
| 44694.916666666664 | 13.79 |
| 44694.927083333336 | 16.53 |
| 44694.9375 | 15.73 |
| 44694.947916666664 | 14.72 |
| 44694.958333333336 | 14.38 |
| 44694.96875 | 13.7 |
| 44694.979166666664 | 12.53 |
| 44694.989583333336 | 11.8 |
| 44695.0 | 11.16 |
| 44695.010416666664 | 10.89 |
| 44695.020833333336 | 8.48 |
| 44695.03125 | 8.44 |
| 44695.041666666664 | 10.39 |
| 44695.052083333336 | 12.15 |
| 44695.0625 | 16.31 |
| 44695.072916666664 | 20.12 |
| 44695.083333333336 | 14.9 |
| 44695.09375 | 25.22 |
| 44695.104166666664 | 25.58 |
| 44695.114583333336 | 28.67 |
| 44695.125 | 31.18 |
| 44695.135416666664 | 37.3 |
| 44695.145833333336 | 43.5 |
| 44695.15625 | 36.36 |
| 44695.166666666664 | 42.21 |
| 44695.177083333336 | 41.56 |
| 44695.1875 | 39.76 |
| 44695.197916666664 | 32.9 |
| 44695.208333333336 | 28.73 |
| 44695.21875 | 25.8 |
| 44695.229166666664 | 22.04 |
| 44695.239583333336 | 19.51 |
| 44695.25 | 18.32 |
| 44695.260416666664 | 17.63 |
| 44695.270833333336 | 18.37 |
| 44695.28125 | 18.13 |
| 44695.291666666664 | 18.92 |
| 44695.302083333336 | 17.93 |
| 44695.3125 | 19.67 |
| 44695.322916666664 | 20.76 |
| 44695.333333333336 | 21.51 |
| 44695.34375 | 22.33 |
| 44695.354166666664 | 21.85 |
| 44695.364583333336 | 24.04 |
| 44695.375 | 19.11 |
| 44695.385416666664 | 19.63 |
| 44695.395833333336 | 17.61 |
| 44695.40625 | 17.45 |
| 44695.416666666664 | 16.49 |
| 44695.427083333336 | 16.07 |
| 44695.4375 | 15.44 |
| 44695.447916666664 | 14.38 |
| 44695.458333333336 | 14.29 |
| 44695.46875 | 15.08 |
| 44695.479166666664 | 11.38 |
| 44695.489583333336 | 13.77 |
| 44695.5 | 13.74 |
| 44695.510416666664 | 12.96 |
| 44695.520833333336 | 9.98 |
| 44695.53125 | 10.78 |
| 44695.541666666664 | 12.02 |
| 44695.552083333336 | 14.68 |
| 44695.5625 | 17.89 |
| 44695.572916666664 | 16.88 |
| 44695.583333333336 | 18.28 |
| 44695.59375 | 17.79 |
| 44695.604166666664 | 19.13 |
| 44695.614583333336 | 21.88 |
| 44695.625 | 25.67 |
| 44695.635416666664 | 27.61 |
| 44695.645833333336 | 27.74 |
| 44695.65625 | 32.26 |
| 44695.666666666664 | 37.35 |
| 44695.677083333336 | 36.71 |
| 44695.6875 | 36.21 |
| 44695.697916666664 | 32.56 |
| 44695.708333333336 | 32.49 |
| 44695.71875 | 33.62 |
| 44695.729166666664 | 36.75 |
| 44695.739583333336 | 27.8 |
| 44695.75 | 29.43 |
| 44695.760416666664 | 21.86 |
| 44695.770833333336 | 26.17 |
| 44695.78125 | 25.66 |
| 44695.791666666664 | 25.24 |
| 44695.802083333336 | 25.19 |
| 44695.8125 | 29.23 |
| 44695.822916666664 | 30.24 |
| 44695.833333333336 | 30.55 |
| 44695.84375 | 32.58 |
| 44695.854166666664 | 26.9 |
| 44695.864583333336 | 28.88 |
| 44695.875 | 27.57 |
| 44695.885416666664 | 26.18 |
| 44695.895833333336 | 26.23 |
| 44695.90625 | 25.08 |
| 44695.916666666664 | 23.05 |
| 44695.927083333336 | 22.08 |
| 44695.9375 | 20.58 |
| 44695.947916666664 | 18.55 |
| 44695.958333333336 | 18.31 |
| 44695.96875 | 16.71 |
| 44695.979166666664 | 16.23 |
| 44695.989583333336 | 16.12 |
| 44696.0 | 14.42 |
| 44696.010416666664 | 14.68 |
| 44696.020833333336 | 13.53 |
| 44696.03125 | 12.72 |
| 44696.041666666664 | 12.61 |
| 44696.052083333336 | 9.4 |
| 44696.0625 | 9.05 |
| 44696.072916666664 | 8.83 |
| 44696.083333333336 | 12.02 |
| 44696.09375 | 14.86 |
| 44696.104166666664 | 17.23 |
| 44696.114583333336 | 17.57 |
| 44696.125 | 23.82 |
| 44696.135416666664 | 30.23 |
| 44696.145833333336 | 36.46 |
| 44696.15625 | 35.28 |
| 44696.166666666664 | 37.69 |
| 44696.177083333336 | 34.62 |
| 44696.1875 | 46.62 |
| 44696.197916666664 | 41.26 |
| 44696.208333333336 | 43.58 |
| 44696.21875 | 44.32 |
| 44696.229166666664 | 39.87 |
| 44696.239583333336 | 38.17 |
| 44696.25 | 32.42 |
| 44696.260416666664 | 26.99 |
| 44696.270833333336 | 26.04 |
| 44696.28125 | 20.96 |
| 44696.291666666664 | 16.87 |
| 44696.302083333336 | 18.51 |
| 44696.3125 | 19.79 |
| 44696.322916666664 | 20.01 |
| 44696.333333333336 | 21.72 |
| 44696.34375 | 27.9 |
| 44696.354166666664 | 23.93 |
| 44696.364583333336 | 24.13 |
| 44696.375 | 23.05 |
| 44696.385416666664 | 20.37 |
| 44696.395833333336 | 20.03 |
| 44696.40625 | 19.5 |
| 44696.416666666664 | 16.91 |
| 44696.427083333336 | 19.6 |
| 44696.4375 | 19.04 |
| 44696.447916666664 | 19.8 |
| 44696.458333333336 | 18.71 |
| 44696.46875 | 18.3 |
| 44696.479166666664 | 18.05 |
| 44696.489583333336 | 20.81 |
| 44696.5 | 16.45 |
| 44696.510416666664 | 15.42 |
| 44696.520833333336 | 13.48 |
| 44696.53125 | 14.36 |
| 44696.541666666664 | 11.8 |
| 44696.552083333336 | 13.6 |
| 44696.5625 | 12.44 |
| 44696.572916666664 | 11.81 |
| 44696.583333333336 | 14.39 |
| 44696.59375 | 17.16 |
| 44696.604166666664 | 19.43 |
| 44696.614583333336 | 23.47 |
| 44696.625 | 23.07 |
| 44696.635416666664 | 23.91 |
| 44696.645833333336 | 21.92 |
| 44696.65625 | 23.56 |
| 44696.666666666664 | 23.66 |
| 44696.677083333336 | 24.05 |
| 44696.6875 | 28.99 |
| 44696.697916666664 | 26.5 |
| 44696.708333333336 | 25.68 |
| 44696.71875 | 24.86 |
| 44696.729166666664 | 24.12 |
| 44696.739583333336 | 24.85 |
| 44696.75 | 23.03 |
| 44696.760416666664 | 21.54 |
| 44696.770833333336 | 25.04 |
| 44696.78125 | 21.97 |
| 44696.791666666664 | 21.3 |
| 44696.802083333336 | 22.47 |
| 44696.8125 | 22.98 |
| 44696.822916666664 | 24.94 |
| 44696.833333333336 | 24.22 |
| 44696.84375 | 26.7 |
| 44696.854166666664 | 28.17 |
| 44696.864583333336 | 34.63 |
| 44696.875 | 35.12 |
| 44696.885416666664 | 37.1 |
| 44696.895833333336 | 41.04 |
| 44696.90625 | 37.46 |
| 44696.916666666664 | 35.4 |
| 44696.927083333336 | 37.16 |
| 44696.9375 | 35.91 |
| 44696.947916666664 | 33.08 |
| 44696.958333333336 | 29.26 |
| 44696.96875 | 26.5 |
| 44696.979166666664 | 23.01 |
| 44696.989583333336 | 22.63 |
| 44697.0 | 21.44 |
| 44697.010416666664 | 33.4 |
| 44697.020833333336 | 18.39 |
| 44697.03125 | 16.11 |
| 44697.041666666664 | 15.64 |
| 44697.052083333336 | 13.89 |
| 44697.0625 | 14.92 |
| 44697.072916666664 | 11.97 |
| 44697.083333333336 | 13.44 |
| 44697.09375 | 11.39 |
| 44697.104166666664 | 11.96 |
| 44697.114583333336 | 11.41 |
| 44697.125 | 14.87 |
| 44697.135416666664 | 14.95 |
| 44697.145833333336 | 14.76 |
| 44697.15625 | 17.8 |
| 44697.166666666664 | 20.88 |
| 44697.177083333336 | 23.53 |
| 44697.1875 | 30.01 |
| 44697.197916666664 | 38.48 |
| 44697.208333333336 | 38.12 |
| 44697.21875 | 43.16 |
| 44697.229166666664 | 42.49 |
| 44697.239583333336 | 52.81 |
| 44697.25 | 51.39 |
| 44697.260416666664 | 45.04 |
| 44697.270833333336 | 39.71 |
| 44697.28125 | 36.36 |
| 44697.291666666664 | 33.88 |
| 44697.302083333336 | 26.35 |
| 44697.3125 | 22.12 |
| 44697.322916666664 | 19.1 |
| 44697.333333333336 | 18.73 |
| 44697.34375 | 20.31 |
| 44697.354166666664 | 21.22 |
| 44697.364583333336 | 22.45 |
| 44697.375 | 24.49 |
| 44697.385416666664 | 26.33 |
| 44697.395833333336 | 27.63 |
| 44697.40625 | 25.85 |
| 44697.416666666664 | 23.95 |
| 44697.427083333336 | 23.99 |
| 44697.4375 | 24.81 |
| 44697.447916666664 | 23.35 |
| 44697.458333333336 | 23.6 |
| 44697.46875 | 24.6 |
| 44697.479166666664 | 23.95 |
| 44697.489583333336 | 23.15 |
| 44697.5 | 21.66 |
| 44697.510416666664 | 21.67 |
| 44697.520833333336 | 21.69 |
| 44697.53125 | 19.13 |
| 44697.541666666664 | 17.09 |
| 44697.552083333336 | 18.74 |
| 44697.5625 | 15.05 |
| 44697.572916666664 | 13.45 |
| 44697.583333333336 | 12.38 |
| 44697.59375 | 12.19 |
| 44697.604166666664 | 11.25 |
| 44697.614583333336 | 11.82 |
| 44697.625 | 11.59 |
| 44697.635416666664 | 17.25 |
| 44697.645833333336 | 21.19 |
| 44697.65625 | 20.79 |
| 44697.666666666664 | 24.97 |
| 44697.677083333336 | 25.27 |
| 44697.6875 | 24.06 |
| 44697.697916666664 | 24.69 |
| 44697.708333333336 | 25.78 |
| 44697.71875 | 24.35 |
| 44697.729166666664 | 25.75 |
| 44697.739583333336 | 26.04 |
| 44697.75 | 24.53 |
| 44697.760416666664 | 23.93 |
| 44697.770833333336 | 21.97 |
| 44697.78125 | 20.99 |
| 44697.791666666664 | 21.21 |
| 44697.802083333336 | 27.69 |
| 44697.8125 | 25.73 |
| 44697.822916666664 | 21.63 |
| 44697.833333333336 | 18.51 |
| 44697.84375 | 24.76 |
| 44697.854166666664 | 28.07 |
| 44697.864583333336 | 27.19 |
| 44697.875 | 28.45 |
| 44697.885416666664 | 34.39 |
| 44697.895833333336 | 38.11 |
| 44697.90625 | 42.69 |
| 44697.916666666664 | 46.52 |
| 44697.927083333336 | 54.79 |
| 44697.9375 | 54.72 |
| 44697.947916666664 | 48.21 |
| 44697.958333333336 | 49.57 |
| 44697.96875 | 51.93 |
| 44697.979166666664 | 52.57 |
| 44697.989583333336 | 48.28 |
| 44698.0 | 42.78 |
| 44698.010416666664 | 38.81 |
| 44698.020833333336 | 35.06 |
| 44698.03125 | 30.6 |
| 44698.041666666664 | 26.96 |
| 44698.052083333336 | 25.29 |
| 44698.0625 | 21.23 |
| 44698.072916666664 | 20.59 |
| 44698.083333333336 | 19.3 |
| 44698.09375 | 15.79 |
| 44698.104166666664 | 14.34 |
| 44698.114583333336 | 13.49 |
| 44698.125 | 13.29 |
| 44698.135416666664 | 14.48 |
| 44698.145833333336 | 16.86 |
| 44698.15625 | 17.02 |
| 44698.166666666664 | 20.23 |
| 44698.177083333336 | 19.3 |
| 44698.1875 | 30.3 |
| 44698.197916666664 | 29.34 |
| 44698.208333333336 | 32.06 |
| 44698.21875 | 38.01 |
| 44698.229166666664 | 39.94 |
| 44698.239583333336 | 36.59 |
| 44698.25 | 41.97 |
| 44698.260416666664 | 45.85 |
| 44698.270833333336 | 54.29 |
| 44698.28125 | 47.94 |
| 44698.291666666664 | 44.29 |
| 44698.302083333336 | 39.56 |
| 44698.3125 | 34.44 |
| 44698.322916666664 | 31.19 |
| 44698.333333333336 | 27.78 |
| 44698.34375 | 23.47 |
| 44698.354166666664 | 24.49 |
| 44698.364583333336 | 18.16 |
| 44698.375 | 18.05 |
| 44698.385416666664 | 21.44 |
| 44698.395833333336 | 21.39 |
| 44698.40625 | 21.89 |
| 44698.416666666664 | 28.18 |
| 44698.427083333336 | 30.19 |
| 44698.4375 | 30.88 |
| 44698.447916666664 | 29.77 |
| 44698.458333333336 | 28.92 |
| 44698.46875 | 25.26 |
| 44698.479166666664 | 23.97 |
| 44698.489583333336 | 19.32 |
| 44698.5 | 22.13 |
| 44698.510416666664 | 22.91 |
| 44698.520833333336 | 22.73 |
| 44698.53125 | 21.5 |
| 44698.541666666664 | 23.11 |
| 44698.552083333336 | 21.07 |
| 44698.5625 | 19.94 |
| 44698.572916666664 | 23.26 |
| 44698.583333333336 | 15.73 |
| 44698.59375 | 16.18 |
| 44698.604166666664 | 13.65 |
| 44698.614583333336 | 14.19 |
| 44698.625 | 12.97 |
| 44698.635416666664 | 12.31 |
| 44698.645833333336 | 12.5 |
| 44698.65625 | 15.17 |
| 44698.666666666664 | 18.37 |
| 44698.677083333336 | 24.46 |
| 44698.6875 | 21.52 |
| 44698.697916666664 | 22.5 |
| 44698.708333333336 | 22.58 |
| 44698.71875 | 23.69 |
| 44698.729166666664 | 28.06 |
| 44698.739583333336 | 26.51 |
| 44698.75 | 24.9 |
| 44698.760416666664 | 24.66 |
| 44698.770833333336 | 23.4 |
| 44698.78125 | 20.77 |
| 44698.791666666664 | 21.5 |
| 44698.802083333336 | 24.59 |
| 44698.8125 | 19.59 |
| 44698.822916666664 | 20.46 |
| 44698.833333333336 | 19.49 |
| 44698.84375 | 16.68 |
| 44698.854166666664 | 16.19 |
| 44698.864583333336 | 18.74 |
| 44698.875 | 28.36 |
| 44698.885416666664 | 27.04 |
| 44698.895833333336 | 25.26 |
| 44698.90625 | 29.56 |
| 44698.916666666664 | 31.17 |
| 44698.927083333336 | 34.55 |
| 44698.9375 | 34.76 |
| 44698.947916666664 | 35.24 |
| 44698.958333333336 | 32.58 |
| 44698.96875 | 34.06 |
| 44698.979166666664 | 35.9 |
| 44698.989583333336 | 41.55 |
| 44699.0 | 43.74 |
| 44699.010416666664 | 39.33 |
| 44699.020833333336 | 38 |
| 44699.03125 | 34.53 |
| 44699.041666666664 | 30.23 |
| 44699.052083333336 | 26.56 |
| 44699.0625 | 24.13 |
| 44699.072916666664 | 19.75 |
| 44699.083333333336 | 19 |
| 44699.09375 | 18.67 |
| 44699.104166666664 | 15.49 |
| 44699.114583333336 | 15.68 |
| 44699.125 | 13.23 |
| 44699.135416666664 | 11.77 |
| 44699.145833333336 | 11.59 |
| 44699.15625 | 10.94 |
| 44699.166666666664 | 11.74 |
| 44699.177083333336 | 11.75 |
| 44699.1875 | 14.32 |
| 44699.197916666664 | 15.81 |
| 44699.208333333336 | 16.32 |
| 44699.21875 | 18.07 |
| 44699.229166666664 | 19.39 |
| 44699.239583333336 | 20.17 |
| 44699.25 | 31.58 |
| 44699.260416666664 | 36.08 |
| 44699.270833333336 | 35.41 |
| 44699.28125 | 37.19 |
| 44699.291666666664 | 42.79 |
| 44699.302083333336 | 51.51 |
| 44699.3125 | 50.4 |
| 44699.322916666664 | 52.02 |
| 44699.333333333336 | 37.14 |
| 44699.34375 | 36.67 |
| 44699.354166666664 | 31.83 |
| 44699.364583333336 | 25.49 |
| 44699.375 | 28.8 |
| 44699.385416666664 | 20.78 |
| 44699.395833333336 | 18.46 |
| 44699.40625 | 16.99 |
| 44699.416666666664 | 19.83 |
| 44699.427083333336 | 20.85 |
| 44699.4375 | 20.74 |
| 44699.447916666664 | 21.63 |
| 44699.458333333336 | 24.39 |
| 44699.46875 | 25.95 |
| 44699.479166666664 | 26.46 |
| 44699.489583333336 | 23.18 |
| 44699.5 | 24.07 |
| 44699.510416666664 | 20.86 |
| 44699.520833333336 | 22.33 |
| 44699.53125 | 21.14 |
| 44699.541666666664 | 21.48 |
| 44699.552083333336 | 22.74 |
| 44699.5625 | 20.59 |
| 44699.572916666664 | 20.3 |
| 44699.583333333336 | 17.46 |
| 44699.59375 | 19.34 |
| 44699.604166666664 | 18.38 |
| 44699.614583333336 | 16.53 |
| 44699.625 | 15.47 |
| 44699.635416666664 | 14.57 |
| 44699.645833333336 | 11.69 |
| 44699.65625 | 11.54 |
| 44699.666666666664 | 12.57 |
| 44699.677083333336 | 15.09 |
| 44699.6875 | 17.19 |
| 44699.697916666664 | 18.99 |
| 44699.708333333336 | 20.38 |
| 44699.71875 | 21.82 |
| 44699.729166666664 | 21.9 |
| 44699.739583333336 | 21.17 |
| 44699.75 | 21.39 |
| 44699.760416666664 | 21.84 |
| 44699.770833333336 | 23.22 |
| 44699.78125 | 21.73 |
| 44699.791666666664 | 21.72 |
| 44699.802083333336 | 21.01 |
| 44699.8125 | 22.19 |
| 44699.822916666664 | 21.15 |
| 44699.833333333336 | 22.39 |
| 44699.84375 | 22.08 |
| 44699.854166666664 | 18.46 |
| 44699.864583333336 | 19.11 |
| 44699.875 | 16.51 |
| 44699.885416666664 | 16.7 |
| 44699.895833333336 | 16.4 |
| 44699.90625 | 17.83 |
| 44699.916666666664 | 23.53 |
| 44699.927083333336 | 23.41 |
| 44699.9375 | 25.08 |
| 44699.947916666664 | 27.96 |
| 44699.958333333336 | 34.67 |
| 44699.96875 | 38.15 |
| 44699.979166666664 | 40.44 |
| 44699.989583333336 | 39.68 |
| 44700.0 | 43.11 |
| 44700.010416666664 | 43.58 |
| 44700.020833333336 | 40.91 |
| 44700.03125 | 37.39 |
| 44700.041666666664 | 34.37 |
| 44700.052083333336 | 30.51 |
| 44700.0625 | 28.38 |
| 44700.072916666664 | 26.14 |
| 44700.083333333336 | 23.32 |
| 44700.09375 | 20.97 |
| 44700.104166666664 | 18.59 |
| 44700.114583333336 | 14.73 |
| 44700.125 | 14.72 |
| 44700.135416666664 | 13.17 |
| 44700.145833333336 | 14.15 |
| 44700.15625 | 13.09 |
| 44700.166666666664 | 12.3 |
| 44700.177083333336 | 11.71 |
| 44700.1875 | 11.11 |
| 44700.197916666664 | 10.88 |
| 44700.208333333336 | 10 |
| 44700.21875 | 12.68 |
| 44700.229166666664 | 12.66 |
| 44700.239583333336 | 13.87 |
| 44700.25 | 15.3 |
| 44700.260416666664 | 16.73 |
| 44700.270833333336 | 16.95 |
| 44700.28125 | 18.97 |
| 44700.291666666664 | 22.79 |
| 44700.302083333336 | 22.81 |
| 44700.3125 | 24.51 |
| 44700.322916666664 | 26.79 |
| 44700.333333333336 | 28.89 |
| 44700.34375 | 31 |
| 44700.354166666664 | 34.32 |
| 44700.364583333336 | 33.5 |
| 44700.375 | 33.21 |
| 44700.385416666664 | 28.63 |
| 44700.395833333336 | 25.74 |
| 44700.40625 | 25.55 |
| 44700.416666666664 | 18.92 |
| 44700.427083333336 | 17.17 |
| 44700.4375 | 19.09 |
| 44700.447916666664 | 20.57 |
| 44700.458333333336 | 20.01 |
| 44700.46875 | 19.73 |
| 44700.479166666664 | 21.45 |
| 44700.489583333336 | 22.59 |
| 44700.5 | 23.49 |
| 44700.510416666664 | 24.09 |
| 44700.520833333336 | 26.18 |
| 44700.53125 | 25.76 |
| 44700.541666666664 | 24 |
| 44700.552083333336 | 25.26 |
| 44700.5625 | 24.69 |
| 44700.572916666664 | 27.56 |
| 44700.583333333336 | 27.52 |
| 44700.59375 | 30.29 |
| 44700.604166666664 | 30.64 |
| 44700.614583333336 | 29.31 |
| 44700.625 | 29.82 |
| 44700.635416666664 | 28.69 |
| 44700.645833333336 | 24.99 |
| 44700.65625 | 20.88 |
| 44700.666666666664 | 19.14 |
| 44700.677083333336 | 16.62 |
| 44700.6875 | 15.53 |
| 44700.697916666664 | 15.2 |
| 44700.708333333336 | 15.03 |
| 44700.71875 | 15.13 |
| 44700.729166666664 | 18.52 |
| 44700.739583333336 | 18.08 |
| 44700.75 | 21.94 |
| 44700.760416666664 | 22.92 |
| 44700.770833333336 | 24.25 |
| 44700.78125 | 21.06 |
| 44700.791666666664 | 23.17 |
| 44700.802083333336 | 24.45 |
| 44700.8125 | 22.15 |
| 44700.822916666664 | 20.16 |
| 44700.833333333336 | 19.66 |
| 44700.84375 | 18.79 |
| 44700.854166666664 | 17.91 |
| 44700.864583333336 | 19.26 |
| 44700.875 | 18.11 |
| 44700.885416666664 | 16.14 |
| 44700.895833333336 | 15.38 |
| 44700.90625 | 14.95 |
| 44700.916666666664 | 14.62 |
| 44700.927083333336 | 13.51 |
| 44700.9375 | 16.58 |
| 44700.947916666664 | 19.61 |
| 44700.958333333336 | 22.4 |
| 44700.96875 | 23.71 |
| 44700.979166666664 | 26.71 |
| 44700.989583333336 | 27.77 |
| 44701.0 | 27.84 |
| 44701.010416666664 | 22.22 |
| 44701.020833333336 | 24.99 |
| 44701.03125 | 24.59 |
| 44701.041666666664 | 24.36 |
| 44701.052083333336 | 24.03 |
| 44701.0625 | 23.01 |
| 44701.072916666664 | 23.99 |
| 44701.083333333336 | 24.77 |
| 44701.09375 | 23.24 |
| 44701.104166666664 | 20.83 |
| 44701.114583333336 | 19.65 |
| 44701.125 | 18.34 |
| 44701.135416666664 | 16.31 |
| 44701.145833333336 | 15.83 |
| 44701.15625 | 15.12 |
| 44701.166666666664 | 13.65 |
| 44701.177083333336 | 12.9 |
| 44701.1875 | 12.5 |
| 44701.197916666664 | 12.66 |
| 44701.208333333336 | 10.65 |
| 44701.21875 | 11.36 |
| 44701.229166666664 | 11 |
| 44701.239583333336 | 10.36 |
| 44701.25 | 10 |
| 44701.260416666664 | 9.65 |
| 44701.270833333336 | 10.74 |
| 44701.28125 | 14.01 |
| 44701.291666666664 | 15.7 |
| 44701.302083333336 | 16.87 |
| 44701.3125 | 18.73 |
| 44701.322916666664 | 23.76 |
| 44701.333333333336 | 21.66 |
| 44701.34375 | 26.6 |
| 44701.354166666664 | 24.53 |
| 44701.364583333336 | 26.97 |
| 44701.375 | 32.72 |
| 44701.385416666664 | 30.42 |
| 44701.395833333336 | 32.93 |
| 44701.40625 | 27.82 |
| 44701.416666666664 | 28.78 |
| 44701.427083333336 | 23.08 |
| 44701.4375 | 19.89 |
| 44701.447916666664 | 17.2 |
| 44701.458333333336 | 15.45 |
| 44701.46875 | 13.93 |
| 44701.479166666664 | 13.67 |
| 44701.489583333336 | 19.93 |
| 44701.5 | 19.48 |
| 44701.510416666664 | 20.79 |
| 44701.520833333336 | 21.11 |
| 44701.53125 | 23.81 |
| 44701.541666666664 | 24.59 |
| 44701.552083333336 | 23.98 |
| 44701.5625 | 24 |
| 44701.572916666664 | 22.84 |
| 44701.583333333336 | 24.31 |
| 44701.59375 | 21.67 |
| 44701.604166666664 | 23.36 |
| 44701.614583333336 | 22.46 |
| 44701.625 | 20.76 |
| 44701.635416666664 | 20.77 |
| 44701.645833333336 | 19.57 |
| 44701.65625 | 18.58 |
| 44701.666666666664 | 18.6 |
| 44701.677083333336 | 16.17 |
| 44701.6875 | 14.09 |
| 44701.697916666664 | 13.3 |
| 44701.708333333336 | 11.87 |
| 44701.71875 | 12.16 |
| 44701.729166666664 | 11.95 |
| 44701.739583333336 | 12.98 |
| 44701.75 | 12.17 |
| 44701.760416666664 | 12.78 |
| 44701.770833333336 | 14.25 |
| 44701.78125 | 17.53 |
| 44701.791666666664 | 18.85 |
| 44701.802083333336 | 19.32 |
| 44701.8125 | 20.98 |
| 44701.822916666664 | 19.71 |
| 44701.833333333336 | 18.8 |
| 44701.84375 | 18.29 |
| 44701.854166666664 | 19.74 |
| 44701.864583333336 | 18.95 |
| 44701.875 | 21.09 |
| 44701.885416666664 | 20.68 |
| 44701.895833333336 | 21.68 |
| 44701.90625 | 20.72 |
| 44701.916666666664 | 19.96 |
| 44701.927083333336 | 20.94 |
| 44701.9375 | 18.18 |
| 44701.947916666664 | 16.13 |
| 44701.958333333336 | 16.48 |
| 44701.96875 | 15.79 |
| 44701.979166666664 | 16.74 |
| 44701.989583333336 | 19.6 |
| 44702.0 | 19.97 |
| 44702.010416666664 | 20.78 |
| 44702.020833333336 | 23.23 |
| 44702.03125 | 24.45 |
| 44702.041666666664 | 26.15 |
| 44702.052083333336 | 26.67 |
| 44702.0625 | 28.64 |
| 44702.072916666664 | 29.37 |
| 44702.083333333336 | 29.95 |
| 44702.09375 | 30.4 |
| 44702.104166666664 | 27.28 |
| 44702.114583333336 | 29.04 |
| 44702.125 | 28.41 |
| 44702.135416666664 | 24.76 |
| 44702.145833333336 | 25.34 |
| 44702.15625 | 24.36 |
| 44702.166666666664 | 22.12 |
| 44702.177083333336 | 20.01 |
| 44702.1875 | 17.88 |
| 44702.197916666664 | 14.85 |
| 44702.208333333336 | 15.28 |
| 44702.21875 | 18.47 |
| 44702.229166666664 | 13.19 |
| 44702.239583333336 | 12.27 |
| 44702.25 | 11.01 |
| 44702.260416666664 | 11.58 |
| 44702.270833333336 | 10.94 |
| 44702.28125 | 11.81 |
| 44702.291666666664 | 11.1 |
| 44702.302083333336 | 12.56 |
| 44702.3125 | 16.44 |
| 44702.322916666664 | 14.69 |
| 44702.333333333336 | 16.48 |
| 44702.34375 | 20.76 |
| 44702.354166666664 | 17.43 |
| 44702.364583333336 | 19.9 |
| 44702.375 | 23.06 |
| 44702.385416666664 | 22.14 |
| 44702.395833333336 | 26.9 |
| 44702.40625 | 25.13 |
| 44702.416666666664 | 25.04 |
| 44702.427083333336 | 29.49 |
| 44702.4375 | 25.38 |
| 44702.447916666664 | 28.09 |
| 44702.458333333336 | 20.38 |
| 44702.46875 | 21.82 |
| 44702.479166666664 | 16.63 |
| 44702.489583333336 | 15.76 |
| 44702.5 | 14.32 |
| 44702.510416666664 | 15.51 |
| 44702.520833333336 | 16.32 |
| 44702.53125 | 18.3 |
| 44702.541666666664 | 18.52 |
| 44702.552083333336 | 19.68 |
| 44702.5625 | 21.78 |
| 44702.572916666664 | 24.69 |
| 44702.583333333336 | 25.44 |
| 44702.59375 | 24.68 |
| 44702.604166666664 | 25.09 |
| 44702.614583333336 | 23.87 |
| 44702.625 | 24.04 |
| 44702.635416666664 | 23.99 |
| 44702.645833333336 | 24.94 |
| 44702.65625 | 23.74 |
| 44702.666666666664 | 23.64 |
| 44702.677083333336 | 23.47 |
| 44702.6875 | 25.66 |
| 44702.697916666664 | 23.97 |
| 44702.708333333336 | 22.15 |
| 44702.71875 | 18.94 |
| 44702.729166666664 | 20.74 |
| 44702.739583333336 | 18.56 |
| 44702.75 | 17.93 |
| 44702.760416666664 | 15.46 |
| 44702.770833333336 | 14.37 |
| 44702.78125 | 14.31 |
| 44702.791666666664 | 15.32 |
| 44702.802083333336 | 14.21 |
| 44702.8125 | 13.87 |
| 44702.822916666664 | 15.21 |
| 44702.833333333336 | 21.01 |
| 44702.84375 | 22.3 |
| 44702.854166666664 | 20.9 |
| 44702.864583333336 | 20.48 |
| 44702.875 | 20.28 |
| 44702.885416666664 | 18.77 |
| 44702.895833333336 | 22.89 |
| 44702.90625 | 20.91 |
| 44702.916666666664 | 21.67 |
| 44702.927083333336 | 20.47 |
| 44702.9375 | 19.84 |
| 44702.947916666664 | 20.61 |
| 44702.958333333336 | 20.58 |
| 44702.96875 | 20.21 |
| 44702.979166666664 | 17.3 |
| 44702.989583333336 | 16.53 |
| 44703.0 | 15.42 |
| 44703.010416666664 | 15.39 |
| 44703.020833333336 | 15.09 |
| 44703.03125 | 19.81 |
| 44703.041666666664 | 19.18 |
| 44703.052083333336 | 20.18 |
| 44703.0625 | 24.1 |
| 44703.072916666664 | 26.24 |
| 44703.083333333336 | 27.99 |
| 44703.09375 | 25.92 |
| 44703.104166666664 | 22.05 |
| 44703.114583333336 | 23.56 |
| 44703.125 | 22.82 |
| 44703.135416666664 | 24.64 |
| 44703.145833333336 | 26.79 |
| 44703.15625 | 28.4 |
| 44703.166666666664 | 28.87 |
| 44703.177083333336 | 31.48 |
| 44703.1875 | 30.17 |
| 44703.197916666664 | 29.8 |
| 44703.208333333336 | 29.26 |
| 44703.21875 | 22.55 |
| 44703.229166666664 | 26.49 |
| 44703.239583333336 | 24.81 |
| 44703.25 | 26.41 |
| 44703.260416666664 | 18.17 |
| 44703.270833333336 | 16.43 |
| 44703.28125 | 15.05 |
| 44703.291666666664 | 13.08 |
| 44703.302083333336 | 14.11 |
| 44703.3125 | 12.99 |
| 44703.322916666664 | 12.95 |
| 44703.333333333336 | 14.3 |
| 44703.34375 | 14.77 |
| 44703.354166666664 | 15.67 |
| 44703.364583333336 | 17.16 |
| 44703.375 | 17.57 |
| 44703.385416666664 | 21.28 |
| 44703.395833333336 | 23.85 |
| 44703.40625 | 24.09 |
| 44703.416666666664 | 27.7 |
| 44703.427083333336 | 26.98 |
| 44703.4375 | 29.54 |
| 44703.447916666664 | 27.74 |
| 44703.458333333336 | 27.97 |
| 44703.46875 | 27.68 |
| 44703.479166666664 | 24.09 |
| 44703.489583333336 | 20.84 |
| 44703.5 | 18.77 |
| 44703.510416666664 | 18.24 |
| 44703.520833333336 | 15.99 |
| 44703.53125 | 15.38 |
| 44703.541666666664 | 15.68 |
| 44703.552083333336 | 15.6 |
| 44703.5625 | 18.92 |
| 44703.572916666664 | 21.77 |
| 44703.583333333336 | 20.29 |
| 44703.59375 | 22.26 |
| 44703.604166666664 | 23.8 |
| 44703.614583333336 | 26.07 |
| 44703.625 | 26.8 |
| 44703.635416666664 | 27.24 |
| 44703.645833333336 | 28.83 |
| 44703.65625 | 29.19 |
| 44703.666666666664 | 30.08 |
| 44703.677083333336 | 30.8 |
| 44703.6875 | 28.49 |
| 44703.697916666664 | 29.12 |
| 44703.708333333336 | 31.2 |
| 44703.71875 | 33.7 |
| 44703.729166666664 | 32.33 |
| 44703.739583333336 | 30.14 |
| 44703.75 | 29.58 |
| 44703.760416666664 | 25.43 |
| 44703.770833333336 | 25.22 |
| 44703.78125 | 21.8 |
| 44703.791666666664 | 21.45 |
| 44703.802083333336 | 17.13 |
| 44703.8125 | 15.28 |
| 44703.822916666664 | 17.36 |
| 44703.833333333336 | 13.6 |
| 44703.84375 | 15.11 |
| 44703.854166666664 | 17.65 |
| 44703.864583333336 | 21.31 |
| 44703.875 | 22.43 |
| 44703.885416666664 | 21.59 |
| 44703.895833333336 | 20.41 |
| 44703.90625 | 21.31 |
| 44703.916666666664 | 21.02 |
| 44703.927083333336 | 22.61 |
| 44703.9375 | 22.28 |
| 44703.947916666664 | 21.38 |
| 44703.958333333336 | 18.42 |
| 44703.96875 | 18.14 |
| 44703.979166666664 | 21.38 |
| 44703.989583333336 | 20.9 |
| 44704.0 | 18.94 |
| 44704.010416666664 | 19.71 |
| 44704.020833333336 | 19.67 |
| 44704.03125 | 18.09 |
| 44704.041666666664 | 16.86 |
| 44704.052083333336 | 14.65 |
| 44704.0625 | 15.67 |
| 44704.072916666664 | 17.79 |
| 44704.083333333336 | 20.65 |
| 44704.09375 | 19.7 |
| 44704.104166666664 | 20.13 |
| 44704.114583333336 | 21.58 |
| 44704.125 | 22.55 |
| 44704.135416666664 | 24.96 |
| 44704.145833333336 | 21.96 |
| 44704.15625 | 21.61 |
| 44704.166666666664 | 21.73 |
| 44704.177083333336 | 21.21 |
| 44704.1875 | 22.41 |
| 44704.197916666664 | 21.65 |
| 44704.208333333336 | 22.26 |
| 44704.21875 | 21.19 |
| 44704.229166666664 | 21.14 |
| 44704.239583333336 | 19.41 |
| 44704.25 | 17.32 |
| 44704.260416666664 | 17.41 |
| 44704.270833333336 | 16.56 |
| 44704.28125 | 15.65 |
| 44704.291666666664 | 17.1 |
| 44704.302083333336 | 15.58 |
| 44704.3125 | 14.49 |
| 44704.322916666664 | 13.02 |
| 44704.333333333336 | 11.77 |
| 44704.34375 | 12.7 |
| 44704.354166666664 | 12.35 |
| 44704.364583333336 | 13.63 |
| 44704.375 | 13.83 |
| 44704.385416666664 | 15.01 |
| 44704.395833333336 | 16.86 |
| 44704.40625 | 17.44 |
| 44704.416666666664 | 19.04 |
| 44704.427083333336 | 25.28 |
| 44704.4375 | 21.49 |
| 44704.447916666664 | 20.55 |
| 44704.458333333336 | 26.39 |
| 44704.46875 | 31.15 |
| 44704.479166666664 | 24.95 |
| 44704.489583333336 | 26.59 |
| 44704.5 | 27.03 |
| 44704.510416666664 | 25.12 |
| 44704.520833333336 | 23.54 |
| 44704.53125 | 19.77 |
| 44704.541666666664 | 19.26 |
| 44704.552083333336 | 16.78 |
| 44704.5625 | 15.24 |
| 44704.572916666664 | 14.01 |
| 44704.583333333336 | 14.3 |
| 44704.59375 | 14.21 |
| 44704.604166666664 | 16.76 |
| 44704.614583333336 | 17.76 |
| 44704.625 | 19.41 |
| 44704.635416666664 | 19.82 |
| 44704.645833333336 | 20.28 |
| 44704.65625 | 23.47 |
| 44704.666666666664 | 25.89 |
| 44704.677083333336 | 23.91 |
| 44704.6875 | 23.41 |
| 44704.697916666664 | 23.34 |
| 44704.708333333336 | 24.3 |
| 44704.71875 | 23.62 |
| 44704.729166666664 | 22.89 |
| 44704.739583333336 | 23.26 |
| 44704.75 | 23.04 |
| 44704.760416666664 | 22.29 |
| 44704.770833333336 | 22.04 |
| 44704.78125 | 22.21 |
| 44704.791666666664 | 23.06 |
| 44704.802083333336 | 20.29 |
| 44704.8125 | 21.44 |
| 44704.822916666664 | 21.26 |
| 44704.833333333336 | 19.88 |
| 44704.84375 | 19.7 |
| 44704.854166666664 | 14.88 |
| 44704.864583333336 | 14.67 |
| 44704.875 | 15.26 |
| 44704.885416666664 | 17.9 |
| 44704.895833333336 | 19.24 |
| 44704.90625 | 21.09 |
| 44704.916666666664 | 23.73 |
| 44704.927083333336 | 21.91 |
| 44704.9375 | 25.52 |
| 44704.947916666664 | 27.51 |
| 44704.958333333336 | 25.86 |
| 44704.96875 | 27.66 |
| 44704.979166666664 | 25.49 |
| 44704.989583333336 | 22.57 |
| 44705.0 | 23.48 |
| 44705.010416666664 | 23.99 |
| 44705.020833333336 | 23.29 |
| 44705.03125 | 22.74 |
| 44705.041666666664 | 22.03 |
| 44705.052083333336 | 19.56 |
| 44705.0625 | 17.89 |
| 44705.072916666664 | 16.56 |
| 44705.083333333336 | 15.61 |
| 44705.09375 | 15 |
| 44705.104166666664 | 13.61 |
| 44705.114583333336 | 13.69 |
| 44705.125 | 14.53 |
| 44705.135416666664 | 16.12 |
| 44705.145833333336 | 18.22 |
| 44705.15625 | 18.56 |
| 44705.166666666664 | 18.1 |
| 44705.177083333336 | 18.85 |
| 44705.1875 | 20.65 |
| 44705.197916666664 | 21.39 |
| 44705.208333333336 | 22.17 |
| 44705.21875 | 21.21 |
| 44705.229166666664 | 21.26 |
| 44705.239583333336 | 20.67 |
| 44705.25 | 19.74 |
| 44705.260416666664 | 21.26 |
| 44705.270833333336 | 21.33 |
| 44705.28125 | 18.57 |
| 44705.291666666664 | 17.13 |
| 44705.302083333336 | 16.57 |
| 44705.3125 | 15.11 |
| 44705.322916666664 | 14.43 |
| 44705.333333333336 | 14.74 |
| 44705.34375 | 18.62 |
| 44705.354166666664 | 14.97 |
| 44705.364583333336 | 13.76 |
| 44705.375 | 12.94 |
| 44705.385416666664 | 13.24 |
| 44705.395833333336 | 13.54 |
| 44705.40625 | 16.62 |
| 44705.416666666664 | 16.25 |
| 44705.427083333336 | 15.14 |
| 44705.4375 | 18.07 |
| 44705.447916666664 | 17.07 |
| 44705.458333333336 | 16.77 |
| 44705.46875 | 23.31 |
| 44705.479166666664 | 24.22 |
| 44705.489583333336 | 25.45 |
| 44705.5 | 29.06 |
| 44705.510416666664 | 28.29 |
| 44705.520833333336 | 28.24 |
| 44705.53125 | 28.4 |
| 44705.541666666664 | 29.17 |
| 44705.552083333336 | 28.86 |
| 44705.5625 | 30.19 |
| 44705.572916666664 | 28.37 |
| 44705.583333333336 | 28.5 |
| 44705.59375 | 24.34 |
| 44705.604166666664 | 24.03 |
| 44705.614583333336 | 18.65 |
| 44705.625 | 17.82 |
| 44705.635416666664 | 17.14 |
| 44705.645833333336 | 20.96 |
| 44705.65625 | 19.54 |
| 44705.666666666664 | 20.46 |
| 44705.677083333336 | 20.04 |
| 44705.6875 | 21.96 |
| 44705.697916666664 | 20.72 |
| 44705.708333333336 | 21.34 |
| 44705.71875 | 21.66 |
| 44705.729166666664 | 23.95 |
| 44705.739583333336 | 25.13 |
| 44705.75 | 27.08 |
| 44705.760416666664 | 28.22 |
| 44705.770833333336 | 27.6 |
| 44705.78125 | 29.25 |
| 44705.791666666664 | 27.74 |
| 44705.802083333336 | 27.26 |
| 44705.8125 | 26.16 |
| 44705.822916666664 | 25.72 |
| 44705.833333333336 | 23.9 |
| 44705.84375 | 22.63 |
| 44705.854166666664 | 22.19 |
| 44705.864583333336 | 21.33 |
| 44705.875 | 18.86 |
| 44705.885416666664 | 16.74 |
| 44705.895833333336 | 16.88 |
| 44705.90625 | 17.23 |
| 44705.916666666664 | 16.24 |
| 44705.927083333336 | 17.26 |
| 44705.9375 | 16.31 |
| 44705.947916666664 | 13.11 |
| 44705.958333333336 | 28.56 |
| 44705.96875 | 20.01 |
| 44705.979166666664 | 25.48 |
| 44705.989583333336 | 22.08 |
| 44706.0 | 24.51 |
| 44706.010416666664 | 25.66 |
| 44706.020833333336 | 24.63 |
| 44706.03125 | 28.85 |
| 44706.041666666664 | 28.6 |
| 44706.052083333336 | 26.74 |
| 44706.0625 | 30.25 |
| 44706.072916666664 | 31.98 |
| 44706.083333333336 | 39.53 |
| 44706.09375 | 41.44 |
| 44706.104166666664 | 49.36 |
| 44706.114583333336 | 48.15 |
| 44706.125 | 51.52 |
| 44706.135416666664 | 50.58 |
| 44706.145833333336 | 34.45 |
| 44706.15625 | 26.62 |
| 44706.166666666664 | 21.32 |
| 44706.177083333336 | 17.83 |
| 44706.1875 | 17.09 |
| 44706.197916666664 | 16.83 |
| 44706.208333333336 | 17.97 |
| 44706.21875 | 17.67 |
| 44706.229166666664 | 17.91 |
| 44706.239583333336 | 17.66 |
| 44706.25 | 18.25 |
| 44706.260416666664 | 18.19 |
| 44706.270833333336 | 19.6 |
| 44706.28125 | 18.3 |
| 44706.291666666664 | 24.24 |
| 44706.302083333336 | 19.28 |
| 44706.3125 | 19.37 |
| 44706.322916666664 | 19.35 |
| 44706.333333333336 | 17.56 |
| 44706.34375 | 18.73 |
| 44706.354166666664 | 18.49 |
| 44706.364583333336 | 20.53 |
| 44706.375 | 17.98 |
| 44706.385416666664 | 14.79 |
| 44706.395833333336 | 13.23 |
| 44706.40625 | 13.95 |
| 44706.416666666664 | 13.73 |
| 44706.427083333336 | 12.25 |
| 44706.4375 | 11.67 |
| 44706.447916666664 | 12.83 |
| 44706.458333333336 | 13.91 |
| 44706.46875 | 15.04 |
| 44706.479166666664 | 16.98 |
| 44706.489583333336 | 18.11 |
| 44706.5 | 20.19 |
| 44706.510416666664 | 20.18 |
| 44706.520833333336 | 25.29 |
| 44706.53125 | 27.34 |
| 44706.541666666664 | 28.05 |
| 44706.552083333336 | 32.12 |
| 44706.5625 | 28.29 |
| 44706.572916666664 | 32.94 |
| 44706.583333333336 | 34.72 |
| 44706.59375 | 33.32 |
| 44706.604166666664 | 35.49 |
| 44706.614583333336 | 40.65 |
| 44706.625 | 36.31 |
| 44706.635416666664 | 31.78 |
| 44706.645833333336 | 27.95 |
| 44706.65625 | 25.79 |
| 44706.666666666664 | 24.9 |
| 44706.677083333336 | 30.17 |
| 44706.6875 | 30.55 |
| 44706.697916666664 | 23.01 |
| 44706.708333333336 | 20.69 |
| 44706.71875 | 17.09 |
| 44706.729166666664 | 18.3 |
| 44706.739583333336 | 19.14 |
| 44706.75 | 19.37 |
| 44706.760416666664 | 19.95 |
| 44706.770833333336 | 22.32 |
| 44706.78125 | 26.99 |
| 44706.791666666664 | 25.55 |
| 44706.802083333336 | 25.81 |
| 44706.8125 | 26.42 |
| 44706.822916666664 | 26.74 |
| 44706.833333333336 | 26.6 |
| 44706.84375 | 27.05 |
| 44706.854166666664 | 25.57 |
| 44706.864583333336 | 25.73 |
| 44706.875 | 23.69 |
| 44706.885416666664 | 22.85 |
| 44706.895833333336 | 20.86 |
| 44706.90625 | 16.65 |
| 44706.916666666664 | 18.44 |
| 44706.927083333336 | 15.45 |
| 44706.9375 | 13.51 |
| 44706.947916666664 | 13.83 |
| 44706.958333333336 | 15.34 |
| 44706.96875 | 14.99 |
| 44706.979166666664 | 14.72 |
| 44706.989583333336 | 15.17 |
| 44707.0 | 15.87 |
| 44707.010416666664 | 16.09 |
| 44707.020833333336 | 17.48 |
| 44707.03125 | 20.32 |
| 44707.041666666664 | 25.64 |
| 44707.052083333336 | 24.58 |
| 44707.0625 | 24.56 |
| 44707.072916666664 | 28.36 |
| 44707.083333333336 | 35.06 |
| 44707.09375 | 27.36 |
| 44707.104166666664 | 38.37 |
| 44707.114583333336 | 45.05 |
| 44707.125 | 43.39 |
| 44707.135416666664 | 48.78 |
| 44707.145833333336 | 37.93 |
| 44707.15625 | 37.96 |
| 44707.166666666664 | 28.95 |
| 44707.177083333336 | 23.53 |
| 44707.1875 | 19.87 |
| 44707.197916666664 | 17.27 |
| 44707.208333333336 | 15.73 |
| 44707.21875 | 17.19 |
| 44707.229166666664 | 17.41 |
| 44707.239583333336 | 17.97 |
| 44707.25 | 18.22 |
| 44707.260416666664 | 17.17 |
| 44707.270833333336 | 16.84 |
| 44707.28125 | 18.73 |
| 44707.291666666664 | 18.61 |
| 44707.302083333336 | 18.09 |
| 44707.3125 | 18.3 |
| 44707.322916666664 | 18.22 |
| 44707.333333333336 | 18.09 |
| 44707.34375 | 17.92 |
| 44707.354166666664 | 17.59 |
| 44707.364583333336 | 17.65 |
| 44707.375 | 16.71 |
| 44707.385416666664 | 16.73 |
| 44707.395833333336 | 16.26 |
| 44707.40625 | 16.15 |
| 44707.416666666664 | 16.44 |
| 44707.427083333336 | 15.13 |
| 44707.4375 | 14.43 |
| 44707.447916666664 | 14.14 |
| 44707.458333333336 | 13.06 |
| 44707.46875 | 11.32 |
| 44707.479166666664 | 12.77 |
| 44707.489583333336 | 14.92 |
| 44707.5 | 14.89 |
| 44707.510416666664 | 14.93 |
| 44707.520833333336 | 17.45 |
| 44707.53125 | 17.42 |
| 44707.541666666664 | 21.31 |
| 44707.552083333336 | 23.21 |
| 44707.5625 | 22.21 |
| 44707.572916666664 | 24.02 |
| 44707.583333333336 | 26.09 |
| 44707.59375 | 29.74 |
| 44707.604166666664 | 28.17 |
| 44707.614583333336 | 28.22 |
| 44707.625 | 28.04 |
| 44707.635416666664 | 24.07 |
| 44707.645833333336 | 24.32 |
| 44707.65625 | 24.9 |
| 44707.666666666664 | 22.62 |
| 44707.677083333336 | 19.4 |
| 44707.6875 | 17.53 |
| 44707.697916666664 | 17.43 |
| 44707.708333333336 | 15.41 |
| 44707.71875 | 16.2 |
| 44707.729166666664 | 17.93 |
| 44707.739583333336 | 18.67 |
| 44707.75 | 18.72 |
| 44707.760416666664 | 18.58 |
| 44707.770833333336 | 18.83 |
| 44707.78125 | 19.63 |
| 44707.791666666664 | 21.2 |
| 44707.802083333336 | 20.77 |
| 44707.8125 | 20.8 |
| 44707.822916666664 | 22.46 |
| 44707.833333333336 | 21.03 |
| 44707.84375 | 22.04 |
| 44707.854166666664 | 20.38 |
| 44707.864583333336 | 21.82 |
| 44707.875 | 20.49 |
| 44707.885416666664 | 20.86 |
| 44707.895833333336 | 20.21 |
| 44707.90625 | 19.02 |
| 44707.916666666664 | 18.28 |
| 44707.927083333336 | 17.45 |
| 44707.9375 | 18.53 |
| 44707.947916666664 | 16.57 |
| 44707.958333333336 | 15.95 |
| 44707.96875 | 16.15 |
| 44707.979166666664 | 14.05 |
| 44707.989583333336 | 12.59 |
| 44708.0 | 11.8 |
| 44708.010416666664 | 14.7 |
| 44708.020833333336 | 16.08 |
| 44708.03125 | 17.31 |
| 44708.041666666664 | 16.97 |
| 44708.052083333336 | 19.06 |
| 44708.0625 | 17.9 |
| 44708.072916666664 | 18.28 |
| 44708.083333333336 | 18.03 |
| 44708.09375 | 20.3 |
| 44708.104166666664 | 21.24 |
| 44708.114583333336 | 23.65 |
| 44708.125 | 25.09 |
| 44708.135416666664 | 23.46 |
| 44708.145833333336 | 25.99 |
| 44708.15625 | 26.05 |
| 44708.166666666664 | 26.15 |
| 44708.177083333336 | 19.61 |
| 44708.1875 | 17.29 |
| 44708.197916666664 | 15.93 |
| 44708.208333333336 | 13.99 |
| 44708.21875 | 13.59 |
| 44708.229166666664 | 14.58 |
| 44708.239583333336 | 14.1 |
| 44708.25 | 14.21 |
| 44708.260416666664 | 16.44 |
| 44708.270833333336 | 17.14 |
| 44708.28125 | 16.62 |
| 44708.291666666664 | 17.25 |
| 44708.302083333336 | 18.52 |
| 44708.3125 | 17.74 |
| 44708.322916666664 | 18.93 |
| 44708.333333333336 | 17.95 |
| 44708.34375 | 18.67 |
| 44708.354166666664 | 17.65 |
| 44708.364583333336 | 18.9 |
| 44708.375 | 18.86 |
| 44708.385416666664 | 19.02 |
| 44708.395833333336 | 19.99 |
| 44708.40625 | 19.77 |
| 44708.416666666664 | 19.6 |
| 44708.427083333336 | 19.03 |
| 44708.4375 | 18.76 |
| 44708.447916666664 | 22.4 |
| 44708.458333333336 | 18.4 |
| 44708.46875 | 15.76 |
| 44708.479166666664 | 14.75 |
| 44708.489583333336 | 15.24 |
| 44708.5 | 16.37 |
| 44708.510416666664 | 14.63 |
| 44708.520833333336 | 13.41 |
| 44708.53125 | 16.01 |
| 44708.541666666664 | 18.62 |
| 44708.552083333336 | 18.53 |
| 44708.5625 | 19.54 |
| 44708.572916666664 | 19.49 |
| 44708.583333333336 | 20.24 |
| 44708.59375 | 18.59 |
| 44708.604166666664 | 19.71 |
| 44708.614583333336 | 20.51 |
| 44708.625 | 20.32 |
| 44708.635416666664 | 20.2 |
| 44708.645833333336 | 18.95 |
| 44708.65625 | 19.43 |
| 44708.666666666664 | 18.9 |
| 44708.677083333336 | 18.31 |
| 44708.6875 | 20 |
| 44708.697916666664 | 20.47 |
| 44708.708333333336 | 20.05 |
| 44708.71875 | 16.25 |
| 44708.729166666664 | 19.35 |
| 44708.739583333336 | 19.59 |
| 44708.75 | 21.85 |
| 44708.760416666664 | 22.9 |
| 44708.770833333336 | 24.02 |
| 44708.78125 | 25.39 |
| 44708.791666666664 | 25.48 |
| 44708.802083333336 | 29.27 |
| 44708.8125 | 31.7 |
| 44708.822916666664 | 36.94 |
| 44708.833333333336 | 36.95 |
| 44708.84375 | 36.65 |
| 44708.854166666664 | 37.36 |
| 44708.864583333336 | 34.88 |
| 44708.875 | 32.69 |
| 44708.885416666664 | 30.31 |
| 44708.895833333336 | 28.45 |
| 44708.90625 | 27.67 |
| 44708.916666666664 | 29.35 |
| 44708.927083333336 | 25.08 |
| 44708.9375 | 25.53 |
| 44708.947916666664 | 24.55 |
| 44708.958333333336 | 23.48 |
| 44708.96875 | 22.04 |
| 44708.979166666664 | 20.49 |
| 44708.989583333336 | 20.85 |
| 44709.0 | 20.27 |
| 44709.010416666664 | 18.83 |
| 44709.020833333336 | 16.97 |
| 44709.03125 | 18.16 |
| 44709.041666666664 | 14.95 |
| 44709.052083333336 | 13.99 |
| 44709.0625 | 14.82 |
| 44709.072916666664 | 18.17 |
| 44709.083333333336 | 25.29 |
| 44709.09375 | 20.35 |
| 44709.104166666664 | 27.67 |
| 44709.114583333336 | 26.04 |
| 44709.125 | 31.67 |
| 44709.135416666664 | 29.52 |
| 44709.145833333336 | 28.29 |
| 44709.15625 | 30.08 |
| 44709.166666666664 | 34.81 |
| 44709.177083333336 | 23.84 |
| 44709.1875 | 30.25 |
| 44709.197916666664 | 31.3 |
| 44709.208333333336 | 26.63 |
| 44709.21875 | 23.36 |
| 44709.229166666664 | 19.46 |
| 44709.239583333336 | 18.52 |
| 44709.25 | 16.89 |
| 44709.260416666664 | 16.62 |
| 44709.270833333336 | 15.45 |
| 44709.28125 | 14.25 |
| 44709.291666666664 | 16.01 |
| 44709.302083333336 | 19.87 |
| 44709.3125 | 19.9 |
| 44709.322916666664 | 19.15 |
| 44709.333333333336 | 21.34 |
| 44709.34375 | 21.21 |
| 44709.354166666664 | 21.83 |
| 44709.364583333336 | 22.07 |
| 44709.375 | 22.44 |
| 44709.385416666664 | 21.75 |
| 44709.395833333336 | 24.08 |
| 44709.40625 | 22.92 |
| 44709.416666666664 | 23.75 |
| 44709.427083333336 | 24.1 |
| 44709.4375 | 25.65 |
| 44709.447916666664 | 23.72 |
| 44709.458333333336 | 24.04 |
| 44709.46875 | 23.3 |
| 44709.479166666664 | 25.27 |
| 44709.489583333336 | 22.85 |
| 44709.5 | 20.09 |
| 44709.510416666664 | 19.38 |
| 44709.520833333336 | 18.89 |
| 44709.53125 | 17.48 |
| 44709.541666666664 | 16.71 |
| 44709.552083333336 | 16.04 |
| 44709.5625 | 18.32 |
| 44709.572916666664 | 24.16 |
| 44709.583333333336 | 21.62 |
| 44709.59375 | 22.21 |
| 44709.604166666664 | 22.85 |
| 44709.614583333336 | 24.92 |
| 44709.625 | 26.13 |
| 44709.635416666664 | 25.49 |
| 44709.645833333336 | 24.45 |
| 44709.65625 | 22.16 |
| 44709.666666666664 | 23.83 |
| 44709.677083333336 | 19.79 |
| 44709.6875 | 20.42 |
| 44709.697916666664 | 20.61 |
| 44709.708333333336 | 20.19 |
| 44709.71875 | 20.82 |
| 44709.729166666664 | 19.47 |
| 44709.739583333336 | 18.53 |
| 44709.75 | 20.73 |
| 44709.760416666664 | 18.94 |
| 44709.770833333336 | 19.08 |
| 44709.78125 | 25.41 |
| 44709.791666666664 | 26.72 |
| 44709.802083333336 | 25.06 |
| 44709.8125 | 28.01 |
| 44709.822916666664 | 53.57 |
| 44709.833333333336 | 32.59 |
| 44709.84375 | 33.09 |
| 44709.854166666664 | 30.81 |
| 44709.864583333336 | 31.5 |
| 44709.875 | 32.27 |
| 44709.885416666664 | 31.27 |
| 44709.895833333336 | 31.63 |
| 44709.90625 | 30.45 |
| 44709.916666666664 | 32.01 |
| 44709.927083333336 | 28.58 |
| 44709.9375 | 27.03 |
| 44709.947916666664 | 27.42 |
| 44709.958333333336 | 25.18 |
| 44709.96875 | 23.9 |
| 44709.979166666664 | 23.06 |
| 44709.989583333336 | 22.38 |
| 44710.0 | 21.13 |
| 44710.010416666664 | 20.19 |
| 44710.020833333336 | 20.39 |
| 44710.03125 | 18.29 |
| 44710.041666666664 | 16.85 |
| 44710.052083333336 | 15.8 |
| 44710.0625 | 14.16 |
| 44710.072916666664 | 14.41 |
| 44710.083333333336 | 14.91 |
| 44710.09375 | 16.43 |
| 44710.104166666664 | 17.37 |
| 44710.114583333336 | 23.47 |
| 44710.125 | 19.09 |
| 44710.135416666664 | 23.86 |
| 44710.145833333336 | 20.09 |
| 44710.15625 | 22.31 |
| 44710.166666666664 | 23.95 |
| 44710.177083333336 | 28.24 |
| 44710.1875 | 27 |
| 44710.197916666664 | 33.77 |
| 44710.208333333336 | 33.65 |
| 44710.21875 | 31.57 |
| 44710.229166666664 | 26.57 |
| 44710.239583333336 | 21.8 |
| 44710.25 | 19.07 |
| 44710.260416666664 | 17.19 |
| 44710.270833333336 | 15.77 |
| 44710.28125 | 14.95 |
| 44710.291666666664 | 13.29 |
| 44710.302083333336 | 13.82 |
| 44710.3125 | 14.97 |
| 44710.322916666664 | 17.26 |
| 44710.333333333336 | 19.99 |
| 44710.34375 | 19.14 |
| 44710.354166666664 | 20.43 |
| 44710.364583333336 | 21.4 |
| 44710.375 | 21.77 |
| 44710.385416666664 | 20.84 |
| 44710.395833333336 | 23.02 |
| 44710.40625 | 23.73 |
| 44710.416666666664 | 23.76 |
| 44710.427083333336 | 24.07 |
| 44710.4375 | 25.18 |
| 44710.447916666664 | 23.66 |
| 44710.458333333336 | 26.53 |
| 44710.46875 | 25.14 |
| 44710.479166666664 | 24.14 |
| 44710.489583333336 | 23.15 |
| 44710.5 | 23.01 |
| 44710.510416666664 | 22.29 |
| 44710.520833333336 | 18.73 |
| 44710.53125 | 19.08 |
| 44710.541666666664 | 18.48 |
| 44710.552083333336 | 18.13 |
| 44710.5625 | 17.22 |
| 44710.572916666664 | 16.37 |
| 44710.583333333336 | 18.37 |
| 44710.59375 | 19.04 |
| 44710.604166666664 | 21.76 |
| 44710.614583333336 | 22.43 |
| 44710.625 | 20.87 |
| 44710.635416666664 | 21.41 |
| 44710.645833333336 | 21.06 |
| 44710.65625 | 24.96 |
| 44710.666666666664 | 21.82 |
| 44710.677083333336 | 20.68 |
| 44710.6875 | 21.48 |
| 44710.697916666664 | 21.87 |
| 44710.708333333336 | 20.38 |
| 44710.71875 | 21.5 |
| 44710.729166666664 | 20.48 |
| 44710.739583333336 | 21.6 |
| 44710.75 | 20 |
| 44710.760416666664 | 20.02 |
| 44710.770833333336 | 19.2 |
| 44710.78125 | 18.58 |
| 44710.791666666664 | 18.31 |
| 44710.802083333336 | 20.48 |
| 44710.8125 | 26.83 |
| 44710.822916666664 | 26.87 |
| 44710.833333333336 | 26.65 |
| 44710.84375 | 27.69 |
| 44710.854166666664 | 29.98 |
| 44710.864583333336 | 34.32 |
| 44710.875 | 34.24 |
| 44710.885416666664 | 33.92 |
| 44710.895833333336 | 33.63 |
| 44710.90625 | 35.42 |
| 44710.916666666664 | 34.93 |
| 44710.927083333336 | 31.46 |
| 44710.9375 | 32.21 |
| 44710.947916666664 | 30.96 |
| 44710.958333333336 | 28.47 |
| 44710.96875 | 26.67 |
| 44710.979166666664 | 24.43 |
| 44710.989583333336 | 25.59 |
| 44711.0 | 24.64 |
| 44711.010416666664 | 23.35 |
| 44711.020833333336 | 22.29 |
| 44711.03125 | 20.21 |
| 44711.041666666664 | 17.14 |
| 44711.052083333336 | 17.24 |
| 44711.0625 | 15.95 |
| 44711.072916666664 | 14.62 |
| 44711.083333333336 | 13.55 |
| 44711.09375 | 14.46 |
| 44711.104166666664 | 13.01 |
| 44711.114583333336 | 16.33 |
| 44711.125 | 18.31 |
| 44711.135416666664 | 16.35 |
| 44711.145833333336 | 20.96 |
| 44711.15625 | 22 |
| 44711.166666666664 | 28.61 |
| 44711.177083333336 | 23.42 |
| 44711.1875 | 21.09 |
| 44711.197916666664 | 21.34 |
| 44711.208333333336 | 29.54 |
| 44711.21875 | 27.21 |
| 44711.229166666664 | 32.23 |
| 44711.239583333336 | 26.14 |
| 44711.25 | 25.57 |
| 44711.260416666664 | 23.45 |
| 44711.270833333336 | 19.9 |
| 44711.28125 | 17.38 |
| 44711.291666666664 | 15.58 |
| 44711.302083333336 | 14.46 |
| 44711.3125 | 13.4 |
| 44711.322916666664 | 12.66 |
| 44711.333333333336 | 14.53 |
| 44711.34375 | 14.58 |
| 44711.354166666664 | 17.38 |
| 44711.364583333336 | 18.05 |
| 44711.375 | 18.42 |
| 44711.385416666664 | 19.72 |
| 44711.395833333336 | 21.73 |
| 44711.40625 | 20.62 |
| 44711.416666666664 | 25.75 |
| 44711.427083333336 | 24.33 |
| 44711.4375 | 24.63 |
| 44711.447916666664 | 23.9 |
| 44711.458333333336 | 24.81 |
| 44711.46875 | 24.53 |
| 44711.479166666664 | 24.69 |
| 44711.489583333336 | 19.1 |
| 44711.5 | 21.72 |
| 44711.510416666664 | 22.01 |
| 44711.520833333336 | 22.79 |
| 44711.53125 | 19.71 |
| 44711.541666666664 | 18.43 |
| 44711.552083333336 | 18.49 |
| 44711.5625 | 17.1 |
| 44711.572916666664 | 15.53 |
| 44711.583333333336 | 16.81 |
| 44711.59375 | 14.79 |
| 44711.604166666664 | 14.8 |
| 44711.614583333336 | 17.04 |
| 44711.625 | 20.26 |
| 44711.635416666664 | 25.37 |
| 44711.645833333336 | 22.66 |
| 44711.65625 | 22.67 |
| 44711.666666666664 | 21.7 |
| 44711.677083333336 | 21.11 |
| 44711.6875 | 22.97 |
| 44711.697916666664 | 21.02 |
| 44711.708333333336 | 21.79 |
| 44711.71875 | 21.69 |
| 44711.729166666664 | 21.37 |
| 44711.739583333336 | 20.08 |
| 44711.75 | 21.17 |
| 44711.760416666664 | 20.71 |
| 44711.770833333336 | 20.22 |
| 44711.78125 | 21.66 |
| 44711.791666666664 | 22.49 |
| 44711.802083333336 | 19.15 |
| 44711.8125 | 16.73 |
| 44711.822916666664 | 19.89 |
| 44711.833333333336 | 20.39 |
| 44711.84375 | 24.99 |
| 44711.854166666664 | 24.24 |
| 44711.864583333336 | 28.35 |
| 44711.875 | 29.46 |
| 44711.885416666664 | 29.87 |
| 44711.895833333336 | 33.08 |
| 44711.90625 | 31.41 |
| 44711.916666666664 | 33.69 |
| 44711.927083333336 | 31.03 |
| 44711.9375 | 30.94 |
| 44711.947916666664 | 29.85 |
| 44711.958333333336 | 27.04 |
| 44711.96875 | 26.2 |
| 44711.979166666664 | 22.24 |
| 44711.989583333336 | 22.5 |
| 44712.0 | 23.78 |
| 44712.010416666664 | 18.22 |
| 44712.020833333336 | 18.42 |
| 44712.03125 | 19.75 |
| 44712.041666666664 | 19.87 |
| 44712.052083333336 | 17.69 |
| 44712.0625 | 17.52 |
| 44712.072916666664 | 16.71 |
| 44712.083333333336 | 15.5 |
| 44712.09375 | 13.47 |
| 44712.104166666664 | 13.75 |
| 44712.114583333336 | 12.92 |
| 44712.125 | 11.79 |
| 44712.135416666664 | 15.42 |
| 44712.145833333336 | 13.11 |
| 44712.15625 | 12.75 |
| 44712.166666666664 | 12.85 |
| 44712.177083333336 | 17.02 |
| 44712.1875 | 15.73 |
| 44712.197916666664 | 18.85 |
| 44712.208333333336 | 22.73 |
| 44712.21875 | 19.98 |
| 44712.229166666664 | 24.34 |
| 44712.239583333336 | 22.36 |
| 44712.25 | 22.31 |
| 44712.260416666664 | 24.43 |
| 44712.270833333336 | 20.44 |
| 44712.28125 | 18.97 |
| 44712.291666666664 | 17.24 |
| 44712.302083333336 | 14.9 |
| 44712.3125 | 13.84 |
| 44712.322916666664 | 13.42 |
| 44712.333333333336 | 14.26 |
| 44712.34375 | 13.37 |
| 44712.354166666664 | 12.22 |
| 44712.364583333336 | 13.58 |
| 44712.375 | 15.77 |
| 44712.385416666664 | 16.07 |
| 44712.395833333336 | 16.17 |
| 44712.40625 | 17.85 |
| 44712.416666666664 | 20.08 |
| 44712.427083333336 | 20.42 |
| 44712.4375 | 20.12 |
| 44712.447916666664 | 20.46 |
| 44712.458333333336 | 20.8 |
| 44712.46875 | 21.16 |
| 44712.479166666664 | 18.46 |
| 44712.489583333336 | 19.84 |
| 44712.5 | 19.75 |
| 44712.510416666664 | 19 |
| 44712.520833333336 | 19.84 |
| 44712.53125 | 19.05 |
| 44712.541666666664 | 37.78 |
| 44712.552083333336 | 17.84 |
| 44712.5625 | 17.08 |
| 44712.572916666664 | 15.07 |
| 44712.583333333336 | 15.92 |
| 44712.59375 | 15.86 |
| 44712.604166666664 | 14.01 |
| 44712.614583333336 | 15.05 |
| 44712.625 | 13.62 |
| 44712.635416666664 | 16.67 |
| 44712.645833333336 | 19.57 |
| 44712.65625 | 22.67 |
| 44712.666666666664 | 20.47 |
| 44712.677083333336 | 21.44 |
| 44712.6875 | 25.49 |
| 44712.697916666664 | 22.89 |
| 44712.708333333336 | 21.82 |
| 44712.71875 | 21.42 |
| 44712.729166666664 | 19.11 |
| 44712.739583333336 | 18.06 |
| 44712.75 | 19.09 |
| 44712.760416666664 | 18.29 |
| 44712.770833333336 | 17.45 |
| 44712.78125 | 17.25 |
| 44712.791666666664 | 18.29 |
| 44712.802083333336 | 18.14 |
| 44712.8125 | 17.94 |
| 44712.822916666664 | 18.32 |
| 44712.833333333336 | 16.43 |
| 44712.84375 | 15.36 |
| 44712.854166666664 | 19.16 |
| 44712.864583333336 | 21.14 |
| 44712.875 | 20.27 |
| 44712.885416666664 | 22.03 |
| 44712.895833333336 | 20.78 |
| 44712.90625 | 21.52 |
| 44712.916666666664 | 22.32 |
| 44712.927083333336 | 22.98 |
| 44712.9375 | 21.92 |
| 44712.947916666664 | 20.91 |
| 44712.958333333336 | 19.31 |
| 44712.96875 | 19.2 |
| 44712.979166666664 | 19.31 |
| 44712.989583333336 | 19.3 |
| 44713.0 | 17.77 |
| 44713.010416666664 | 17.79 |
| 44713.020833333336 | 17.22 |
| 44713.03125 | 17.55 |
| 44713.041666666664 | 14.52 |
| 44713.052083333336 | 21.22 |
| 44713.0625 | 16.98 |
| 44713.072916666664 | 17.14 |
| 44713.083333333336 | 16.26 |
| 44713.09375 | 13.87 |
| 44713.104166666664 | 15.7 |
| 44713.114583333336 | 12.59 |
| 44713.125 | 14.23 |
| 44713.135416666664 | 16.89 |
| 44713.145833333336 | 11.86 |
| 44713.15625 | 12.38 |